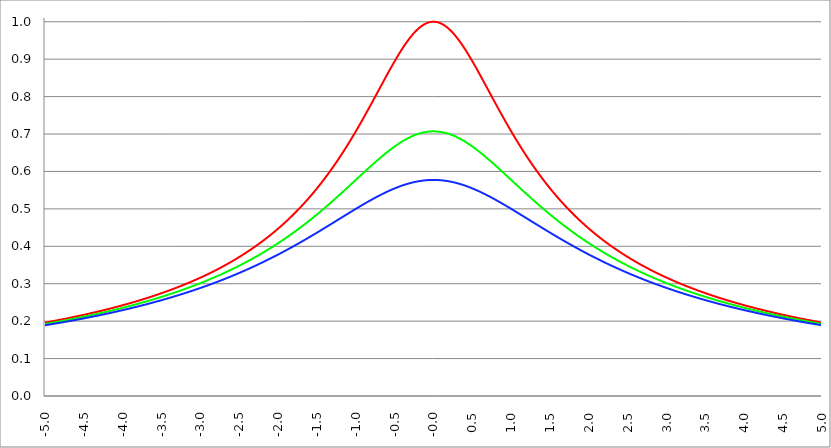
| Category | Series 1 | Series 0 | Series 2 |
|---|---|---|---|
| -5.0 | 0.196 | 0.192 | 0.189 |
| -4.995 | 0.196 | 0.193 | 0.189 |
| -4.99 | 0.196 | 0.193 | 0.189 |
| -4.985 | 0.197 | 0.193 | 0.189 |
| -4.98 | 0.197 | 0.193 | 0.19 |
| -4.975 | 0.197 | 0.193 | 0.19 |
| -4.97 | 0.197 | 0.194 | 0.19 |
| -4.965000000000001 | 0.197 | 0.194 | 0.19 |
| -4.960000000000001 | 0.198 | 0.194 | 0.19 |
| -4.955000000000001 | 0.198 | 0.194 | 0.191 |
| -4.950000000000001 | 0.198 | 0.194 | 0.191 |
| -4.945000000000001 | 0.198 | 0.194 | 0.191 |
| -4.940000000000001 | 0.198 | 0.195 | 0.191 |
| -4.935000000000001 | 0.199 | 0.195 | 0.191 |
| -4.930000000000001 | 0.199 | 0.195 | 0.191 |
| -4.925000000000002 | 0.199 | 0.195 | 0.192 |
| -4.920000000000002 | 0.199 | 0.195 | 0.192 |
| -4.915000000000002 | 0.199 | 0.196 | 0.192 |
| -4.910000000000002 | 0.2 | 0.196 | 0.192 |
| -4.905000000000002 | 0.2 | 0.196 | 0.192 |
| -4.900000000000002 | 0.2 | 0.196 | 0.192 |
| -4.895000000000002 | 0.2 | 0.196 | 0.193 |
| -4.890000000000002 | 0.2 | 0.196 | 0.193 |
| -4.885000000000002 | 0.201 | 0.197 | 0.193 |
| -4.880000000000002 | 0.201 | 0.197 | 0.193 |
| -4.875000000000003 | 0.201 | 0.197 | 0.193 |
| -4.870000000000003 | 0.201 | 0.197 | 0.193 |
| -4.865000000000003 | 0.201 | 0.197 | 0.194 |
| -4.860000000000003 | 0.202 | 0.198 | 0.194 |
| -4.855000000000003 | 0.202 | 0.198 | 0.194 |
| -4.850000000000003 | 0.202 | 0.198 | 0.194 |
| -4.845000000000003 | 0.202 | 0.198 | 0.194 |
| -4.840000000000003 | 0.202 | 0.198 | 0.195 |
| -4.835000000000003 | 0.203 | 0.199 | 0.195 |
| -4.830000000000004 | 0.203 | 0.199 | 0.195 |
| -4.825000000000004 | 0.203 | 0.199 | 0.195 |
| -4.820000000000004 | 0.203 | 0.199 | 0.195 |
| -4.815000000000004 | 0.203 | 0.199 | 0.195 |
| -4.810000000000004 | 0.204 | 0.199 | 0.196 |
| -4.805000000000004 | 0.204 | 0.2 | 0.196 |
| -4.800000000000004 | 0.204 | 0.2 | 0.196 |
| -4.795000000000004 | 0.204 | 0.2 | 0.196 |
| -4.790000000000004 | 0.204 | 0.2 | 0.196 |
| -4.785000000000004 | 0.205 | 0.2 | 0.197 |
| -4.780000000000004 | 0.205 | 0.201 | 0.197 |
| -4.775000000000004 | 0.205 | 0.201 | 0.197 |
| -4.770000000000004 | 0.205 | 0.201 | 0.197 |
| -4.765000000000005 | 0.205 | 0.201 | 0.197 |
| -4.760000000000005 | 0.206 | 0.201 | 0.197 |
| -4.755000000000005 | 0.206 | 0.202 | 0.198 |
| -4.750000000000005 | 0.206 | 0.202 | 0.198 |
| -4.745000000000005 | 0.206 | 0.202 | 0.198 |
| -4.740000000000005 | 0.206 | 0.202 | 0.198 |
| -4.735000000000005 | 0.207 | 0.202 | 0.198 |
| -4.730000000000005 | 0.207 | 0.203 | 0.199 |
| -4.725000000000006 | 0.207 | 0.203 | 0.199 |
| -4.720000000000006 | 0.207 | 0.203 | 0.199 |
| -4.715000000000006 | 0.207 | 0.203 | 0.199 |
| -4.710000000000006 | 0.208 | 0.203 | 0.199 |
| -4.705000000000006 | 0.208 | 0.204 | 0.199 |
| -4.700000000000006 | 0.208 | 0.204 | 0.2 |
| -4.695000000000006 | 0.208 | 0.204 | 0.2 |
| -4.690000000000006 | 0.209 | 0.204 | 0.2 |
| -4.685000000000007 | 0.209 | 0.204 | 0.2 |
| -4.680000000000007 | 0.209 | 0.205 | 0.2 |
| -4.675000000000007 | 0.209 | 0.205 | 0.201 |
| -4.670000000000007 | 0.209 | 0.205 | 0.201 |
| -4.665000000000007 | 0.21 | 0.205 | 0.201 |
| -4.660000000000007 | 0.21 | 0.205 | 0.201 |
| -4.655000000000007 | 0.21 | 0.206 | 0.201 |
| -4.650000000000007 | 0.21 | 0.206 | 0.202 |
| -4.645000000000007 | 0.21 | 0.206 | 0.202 |
| -4.640000000000008 | 0.211 | 0.206 | 0.202 |
| -4.635000000000008 | 0.211 | 0.206 | 0.202 |
| -4.630000000000008 | 0.211 | 0.207 | 0.202 |
| -4.625000000000008 | 0.211 | 0.207 | 0.202 |
| -4.620000000000008 | 0.212 | 0.207 | 0.203 |
| -4.615000000000008 | 0.212 | 0.207 | 0.203 |
| -4.610000000000008 | 0.212 | 0.207 | 0.203 |
| -4.605000000000008 | 0.212 | 0.208 | 0.203 |
| -4.600000000000008 | 0.212 | 0.208 | 0.203 |
| -4.595000000000009 | 0.213 | 0.208 | 0.204 |
| -4.590000000000009 | 0.213 | 0.208 | 0.204 |
| -4.585000000000009 | 0.213 | 0.208 | 0.204 |
| -4.580000000000009 | 0.213 | 0.209 | 0.204 |
| -4.57500000000001 | 0.214 | 0.209 | 0.204 |
| -4.57000000000001 | 0.214 | 0.209 | 0.205 |
| -4.565000000000009 | 0.214 | 0.209 | 0.205 |
| -4.560000000000009 | 0.214 | 0.209 | 0.205 |
| -4.555000000000009 | 0.214 | 0.21 | 0.205 |
| -4.55000000000001 | 0.215 | 0.21 | 0.205 |
| -4.54500000000001 | 0.215 | 0.21 | 0.206 |
| -4.54000000000001 | 0.215 | 0.21 | 0.206 |
| -4.53500000000001 | 0.215 | 0.211 | 0.206 |
| -4.53000000000001 | 0.216 | 0.211 | 0.206 |
| -4.52500000000001 | 0.216 | 0.211 | 0.206 |
| -4.52000000000001 | 0.216 | 0.211 | 0.207 |
| -4.51500000000001 | 0.216 | 0.211 | 0.207 |
| -4.51000000000001 | 0.216 | 0.212 | 0.207 |
| -4.505000000000011 | 0.217 | 0.212 | 0.207 |
| -4.500000000000011 | 0.217 | 0.212 | 0.207 |
| -4.495000000000011 | 0.217 | 0.212 | 0.208 |
| -4.490000000000011 | 0.217 | 0.212 | 0.208 |
| -4.485000000000011 | 0.218 | 0.213 | 0.208 |
| -4.480000000000011 | 0.218 | 0.213 | 0.208 |
| -4.475000000000011 | 0.218 | 0.213 | 0.208 |
| -4.470000000000011 | 0.218 | 0.213 | 0.209 |
| -4.465000000000011 | 0.219 | 0.214 | 0.209 |
| -4.460000000000011 | 0.219 | 0.214 | 0.209 |
| -4.455000000000012 | 0.219 | 0.214 | 0.209 |
| -4.450000000000012 | 0.219 | 0.214 | 0.209 |
| -4.445000000000012 | 0.219 | 0.214 | 0.21 |
| -4.440000000000012 | 0.22 | 0.215 | 0.21 |
| -4.435000000000012 | 0.22 | 0.215 | 0.21 |
| -4.430000000000012 | 0.22 | 0.215 | 0.21 |
| -4.425000000000012 | 0.22 | 0.215 | 0.21 |
| -4.420000000000012 | 0.221 | 0.215 | 0.211 |
| -4.415000000000012 | 0.221 | 0.216 | 0.211 |
| -4.410000000000013 | 0.221 | 0.216 | 0.211 |
| -4.405000000000013 | 0.221 | 0.216 | 0.211 |
| -4.400000000000013 | 0.222 | 0.216 | 0.211 |
| -4.395000000000013 | 0.222 | 0.217 | 0.212 |
| -4.390000000000013 | 0.222 | 0.217 | 0.212 |
| -4.385000000000013 | 0.222 | 0.217 | 0.212 |
| -4.380000000000013 | 0.223 | 0.217 | 0.212 |
| -4.375000000000013 | 0.223 | 0.217 | 0.213 |
| -4.370000000000013 | 0.223 | 0.218 | 0.213 |
| -4.365000000000013 | 0.223 | 0.218 | 0.213 |
| -4.360000000000014 | 0.224 | 0.218 | 0.213 |
| -4.355000000000014 | 0.224 | 0.218 | 0.213 |
| -4.350000000000014 | 0.224 | 0.219 | 0.214 |
| -4.345000000000014 | 0.224 | 0.219 | 0.214 |
| -4.340000000000014 | 0.225 | 0.219 | 0.214 |
| -4.335000000000014 | 0.225 | 0.219 | 0.214 |
| -4.330000000000014 | 0.225 | 0.22 | 0.214 |
| -4.325000000000014 | 0.225 | 0.22 | 0.215 |
| -4.320000000000014 | 0.226 | 0.22 | 0.215 |
| -4.315000000000015 | 0.226 | 0.22 | 0.215 |
| -4.310000000000015 | 0.226 | 0.22 | 0.215 |
| -4.305000000000015 | 0.226 | 0.221 | 0.216 |
| -4.300000000000015 | 0.227 | 0.221 | 0.216 |
| -4.295000000000015 | 0.227 | 0.221 | 0.216 |
| -4.290000000000015 | 0.227 | 0.221 | 0.216 |
| -4.285000000000015 | 0.227 | 0.222 | 0.216 |
| -4.280000000000015 | 0.228 | 0.222 | 0.217 |
| -4.275000000000015 | 0.228 | 0.222 | 0.217 |
| -4.270000000000015 | 0.228 | 0.222 | 0.217 |
| -4.265000000000016 | 0.228 | 0.223 | 0.217 |
| -4.260000000000016 | 0.229 | 0.223 | 0.217 |
| -4.255000000000016 | 0.229 | 0.223 | 0.218 |
| -4.250000000000016 | 0.229 | 0.223 | 0.218 |
| -4.245000000000016 | 0.229 | 0.223 | 0.218 |
| -4.240000000000016 | 0.23 | 0.224 | 0.218 |
| -4.235000000000016 | 0.23 | 0.224 | 0.219 |
| -4.230000000000016 | 0.23 | 0.224 | 0.219 |
| -4.225000000000017 | 0.23 | 0.224 | 0.219 |
| -4.220000000000017 | 0.231 | 0.225 | 0.219 |
| -4.215000000000017 | 0.231 | 0.225 | 0.219 |
| -4.210000000000017 | 0.231 | 0.225 | 0.22 |
| -4.205000000000017 | 0.231 | 0.225 | 0.22 |
| -4.200000000000017 | 0.232 | 0.226 | 0.22 |
| -4.195000000000017 | 0.232 | 0.226 | 0.22 |
| -4.190000000000017 | 0.232 | 0.226 | 0.221 |
| -4.185000000000017 | 0.232 | 0.226 | 0.221 |
| -4.180000000000017 | 0.233 | 0.227 | 0.221 |
| -4.175000000000018 | 0.233 | 0.227 | 0.221 |
| -4.170000000000018 | 0.233 | 0.227 | 0.221 |
| -4.165000000000018 | 0.233 | 0.227 | 0.222 |
| -4.160000000000018 | 0.234 | 0.228 | 0.222 |
| -4.155000000000018 | 0.234 | 0.228 | 0.222 |
| -4.150000000000018 | 0.234 | 0.228 | 0.222 |
| -4.145000000000018 | 0.235 | 0.228 | 0.223 |
| -4.140000000000018 | 0.235 | 0.229 | 0.223 |
| -4.135000000000018 | 0.235 | 0.229 | 0.223 |
| -4.130000000000019 | 0.235 | 0.229 | 0.223 |
| -4.125000000000019 | 0.236 | 0.229 | 0.224 |
| -4.120000000000019 | 0.236 | 0.23 | 0.224 |
| -4.115000000000019 | 0.236 | 0.23 | 0.224 |
| -4.110000000000019 | 0.236 | 0.23 | 0.224 |
| -4.105000000000019 | 0.237 | 0.23 | 0.224 |
| -4.100000000000019 | 0.237 | 0.231 | 0.225 |
| -4.095000000000019 | 0.237 | 0.231 | 0.225 |
| -4.090000000000019 | 0.238 | 0.231 | 0.225 |
| -4.085000000000019 | 0.238 | 0.231 | 0.225 |
| -4.08000000000002 | 0.238 | 0.232 | 0.226 |
| -4.07500000000002 | 0.238 | 0.232 | 0.226 |
| -4.07000000000002 | 0.239 | 0.232 | 0.226 |
| -4.06500000000002 | 0.239 | 0.232 | 0.226 |
| -4.06000000000002 | 0.239 | 0.233 | 0.227 |
| -4.05500000000002 | 0.239 | 0.233 | 0.227 |
| -4.05000000000002 | 0.24 | 0.233 | 0.227 |
| -4.04500000000002 | 0.24 | 0.233 | 0.227 |
| -4.04000000000002 | 0.24 | 0.234 | 0.227 |
| -4.03500000000002 | 0.241 | 0.234 | 0.228 |
| -4.03000000000002 | 0.241 | 0.234 | 0.228 |
| -4.025000000000021 | 0.241 | 0.234 | 0.228 |
| -4.020000000000021 | 0.241 | 0.235 | 0.228 |
| -4.015000000000021 | 0.242 | 0.235 | 0.229 |
| -4.010000000000021 | 0.242 | 0.235 | 0.229 |
| -4.005000000000021 | 0.242 | 0.235 | 0.229 |
| -4.000000000000021 | 0.243 | 0.236 | 0.229 |
| -3.995000000000021 | 0.243 | 0.236 | 0.23 |
| -3.990000000000021 | 0.243 | 0.236 | 0.23 |
| -3.985000000000022 | 0.243 | 0.236 | 0.23 |
| -3.980000000000022 | 0.244 | 0.237 | 0.23 |
| -3.975000000000022 | 0.244 | 0.237 | 0.231 |
| -3.970000000000022 | 0.244 | 0.237 | 0.231 |
| -3.965000000000022 | 0.245 | 0.238 | 0.231 |
| -3.960000000000022 | 0.245 | 0.238 | 0.231 |
| -3.955000000000022 | 0.245 | 0.238 | 0.232 |
| -3.950000000000022 | 0.245 | 0.238 | 0.232 |
| -3.945000000000022 | 0.246 | 0.239 | 0.232 |
| -3.940000000000023 | 0.246 | 0.239 | 0.232 |
| -3.935000000000023 | 0.246 | 0.239 | 0.233 |
| -3.930000000000023 | 0.247 | 0.239 | 0.233 |
| -3.925000000000023 | 0.247 | 0.24 | 0.233 |
| -3.920000000000023 | 0.247 | 0.24 | 0.233 |
| -3.915000000000023 | 0.247 | 0.24 | 0.234 |
| -3.910000000000023 | 0.248 | 0.241 | 0.234 |
| -3.905000000000023 | 0.248 | 0.241 | 0.234 |
| -3.900000000000023 | 0.248 | 0.241 | 0.234 |
| -3.895000000000023 | 0.249 | 0.241 | 0.235 |
| -3.890000000000024 | 0.249 | 0.242 | 0.235 |
| -3.885000000000024 | 0.249 | 0.242 | 0.235 |
| -3.880000000000024 | 0.25 | 0.242 | 0.235 |
| -3.875000000000024 | 0.25 | 0.242 | 0.236 |
| -3.870000000000024 | 0.25 | 0.243 | 0.236 |
| -3.865000000000024 | 0.25 | 0.243 | 0.236 |
| -3.860000000000024 | 0.251 | 0.243 | 0.236 |
| -3.855000000000024 | 0.251 | 0.244 | 0.237 |
| -3.850000000000024 | 0.251 | 0.244 | 0.237 |
| -3.845000000000025 | 0.252 | 0.244 | 0.237 |
| -3.840000000000025 | 0.252 | 0.244 | 0.237 |
| -3.835000000000025 | 0.252 | 0.245 | 0.238 |
| -3.830000000000025 | 0.253 | 0.245 | 0.238 |
| -3.825000000000025 | 0.253 | 0.245 | 0.238 |
| -3.820000000000025 | 0.253 | 0.245 | 0.238 |
| -3.815000000000025 | 0.254 | 0.246 | 0.239 |
| -3.810000000000025 | 0.254 | 0.246 | 0.239 |
| -3.805000000000025 | 0.254 | 0.246 | 0.239 |
| -3.800000000000026 | 0.254 | 0.247 | 0.239 |
| -3.795000000000026 | 0.255 | 0.247 | 0.24 |
| -3.790000000000026 | 0.255 | 0.247 | 0.24 |
| -3.785000000000026 | 0.255 | 0.247 | 0.24 |
| -3.780000000000026 | 0.256 | 0.248 | 0.241 |
| -3.775000000000026 | 0.256 | 0.248 | 0.241 |
| -3.770000000000026 | 0.256 | 0.248 | 0.241 |
| -3.765000000000026 | 0.257 | 0.249 | 0.241 |
| -3.760000000000026 | 0.257 | 0.249 | 0.242 |
| -3.755000000000026 | 0.257 | 0.249 | 0.242 |
| -3.750000000000027 | 0.258 | 0.25 | 0.242 |
| -3.745000000000027 | 0.258 | 0.25 | 0.242 |
| -3.740000000000027 | 0.258 | 0.25 | 0.243 |
| -3.735000000000027 | 0.259 | 0.25 | 0.243 |
| -3.730000000000027 | 0.259 | 0.251 | 0.243 |
| -3.725000000000027 | 0.259 | 0.251 | 0.243 |
| -3.720000000000027 | 0.26 | 0.251 | 0.244 |
| -3.715000000000027 | 0.26 | 0.252 | 0.244 |
| -3.710000000000027 | 0.26 | 0.252 | 0.244 |
| -3.705000000000028 | 0.261 | 0.252 | 0.245 |
| -3.700000000000028 | 0.261 | 0.252 | 0.245 |
| -3.695000000000028 | 0.261 | 0.253 | 0.245 |
| -3.690000000000028 | 0.262 | 0.253 | 0.245 |
| -3.685000000000028 | 0.262 | 0.253 | 0.246 |
| -3.680000000000028 | 0.262 | 0.254 | 0.246 |
| -3.675000000000028 | 0.263 | 0.254 | 0.246 |
| -3.670000000000028 | 0.263 | 0.254 | 0.246 |
| -3.665000000000028 | 0.263 | 0.255 | 0.247 |
| -3.660000000000028 | 0.264 | 0.255 | 0.247 |
| -3.655000000000029 | 0.264 | 0.255 | 0.247 |
| -3.650000000000029 | 0.264 | 0.255 | 0.248 |
| -3.645000000000029 | 0.265 | 0.256 | 0.248 |
| -3.640000000000029 | 0.265 | 0.256 | 0.248 |
| -3.635000000000029 | 0.265 | 0.256 | 0.248 |
| -3.630000000000029 | 0.266 | 0.257 | 0.249 |
| -3.625000000000029 | 0.266 | 0.257 | 0.249 |
| -3.620000000000029 | 0.266 | 0.257 | 0.249 |
| -3.615000000000029 | 0.267 | 0.258 | 0.249 |
| -3.61000000000003 | 0.267 | 0.258 | 0.25 |
| -3.60500000000003 | 0.267 | 0.258 | 0.25 |
| -3.60000000000003 | 0.268 | 0.259 | 0.25 |
| -3.59500000000003 | 0.268 | 0.259 | 0.251 |
| -3.59000000000003 | 0.268 | 0.259 | 0.251 |
| -3.58500000000003 | 0.269 | 0.259 | 0.251 |
| -3.58000000000003 | 0.269 | 0.26 | 0.251 |
| -3.57500000000003 | 0.269 | 0.26 | 0.252 |
| -3.57000000000003 | 0.27 | 0.26 | 0.252 |
| -3.565000000000031 | 0.27 | 0.261 | 0.252 |
| -3.560000000000031 | 0.27 | 0.261 | 0.253 |
| -3.555000000000031 | 0.271 | 0.261 | 0.253 |
| -3.550000000000031 | 0.271 | 0.262 | 0.253 |
| -3.545000000000031 | 0.271 | 0.262 | 0.253 |
| -3.540000000000031 | 0.272 | 0.262 | 0.254 |
| -3.535000000000031 | 0.272 | 0.263 | 0.254 |
| -3.530000000000031 | 0.273 | 0.263 | 0.254 |
| -3.525000000000031 | 0.273 | 0.263 | 0.255 |
| -3.520000000000032 | 0.273 | 0.264 | 0.255 |
| -3.515000000000032 | 0.274 | 0.264 | 0.255 |
| -3.510000000000032 | 0.274 | 0.264 | 0.255 |
| -3.505000000000032 | 0.274 | 0.265 | 0.256 |
| -3.500000000000032 | 0.275 | 0.265 | 0.256 |
| -3.495000000000032 | 0.275 | 0.265 | 0.256 |
| -3.490000000000032 | 0.275 | 0.266 | 0.257 |
| -3.485000000000032 | 0.276 | 0.266 | 0.257 |
| -3.480000000000032 | 0.276 | 0.266 | 0.257 |
| -3.475000000000032 | 0.277 | 0.267 | 0.258 |
| -3.470000000000033 | 0.277 | 0.267 | 0.258 |
| -3.465000000000033 | 0.277 | 0.267 | 0.258 |
| -3.460000000000033 | 0.278 | 0.268 | 0.258 |
| -3.455000000000033 | 0.278 | 0.268 | 0.259 |
| -3.450000000000033 | 0.278 | 0.268 | 0.259 |
| -3.445000000000033 | 0.279 | 0.269 | 0.259 |
| -3.440000000000033 | 0.279 | 0.269 | 0.26 |
| -3.435000000000033 | 0.28 | 0.269 | 0.26 |
| -3.430000000000033 | 0.28 | 0.27 | 0.26 |
| -3.425000000000034 | 0.28 | 0.27 | 0.261 |
| -3.420000000000034 | 0.281 | 0.27 | 0.261 |
| -3.415000000000034 | 0.281 | 0.271 | 0.261 |
| -3.410000000000034 | 0.281 | 0.271 | 0.261 |
| -3.405000000000034 | 0.282 | 0.271 | 0.262 |
| -3.400000000000034 | 0.282 | 0.272 | 0.262 |
| -3.395000000000034 | 0.283 | 0.272 | 0.262 |
| -3.390000000000034 | 0.283 | 0.272 | 0.263 |
| -3.385000000000034 | 0.283 | 0.273 | 0.263 |
| -3.380000000000034 | 0.284 | 0.273 | 0.263 |
| -3.375000000000035 | 0.284 | 0.273 | 0.264 |
| -3.370000000000035 | 0.284 | 0.274 | 0.264 |
| -3.365000000000035 | 0.285 | 0.274 | 0.264 |
| -3.360000000000035 | 0.285 | 0.274 | 0.265 |
| -3.355000000000035 | 0.286 | 0.275 | 0.265 |
| -3.350000000000035 | 0.286 | 0.275 | 0.265 |
| -3.345000000000035 | 0.286 | 0.275 | 0.265 |
| -3.340000000000035 | 0.287 | 0.276 | 0.266 |
| -3.335000000000035 | 0.287 | 0.276 | 0.266 |
| -3.330000000000036 | 0.288 | 0.276 | 0.266 |
| -3.325000000000036 | 0.288 | 0.277 | 0.267 |
| -3.320000000000036 | 0.288 | 0.277 | 0.267 |
| -3.315000000000036 | 0.289 | 0.277 | 0.267 |
| -3.310000000000036 | 0.289 | 0.278 | 0.268 |
| -3.305000000000036 | 0.29 | 0.278 | 0.268 |
| -3.300000000000036 | 0.29 | 0.279 | 0.268 |
| -3.295000000000036 | 0.29 | 0.279 | 0.269 |
| -3.290000000000036 | 0.291 | 0.279 | 0.269 |
| -3.285000000000036 | 0.291 | 0.28 | 0.269 |
| -3.280000000000036 | 0.292 | 0.28 | 0.27 |
| -3.275000000000037 | 0.292 | 0.28 | 0.27 |
| -3.270000000000037 | 0.292 | 0.281 | 0.27 |
| -3.265000000000037 | 0.293 | 0.281 | 0.271 |
| -3.260000000000037 | 0.293 | 0.281 | 0.271 |
| -3.255000000000037 | 0.294 | 0.282 | 0.271 |
| -3.250000000000037 | 0.294 | 0.282 | 0.272 |
| -3.245000000000037 | 0.294 | 0.283 | 0.272 |
| -3.240000000000037 | 0.295 | 0.283 | 0.272 |
| -3.235000000000038 | 0.295 | 0.283 | 0.273 |
| -3.230000000000038 | 0.296 | 0.284 | 0.273 |
| -3.225000000000038 | 0.296 | 0.284 | 0.273 |
| -3.220000000000038 | 0.297 | 0.284 | 0.274 |
| -3.215000000000038 | 0.297 | 0.285 | 0.274 |
| -3.210000000000038 | 0.297 | 0.285 | 0.274 |
| -3.205000000000038 | 0.298 | 0.285 | 0.274 |
| -3.200000000000038 | 0.298 | 0.286 | 0.275 |
| -3.195000000000038 | 0.299 | 0.286 | 0.275 |
| -3.190000000000039 | 0.299 | 0.287 | 0.275 |
| -3.185000000000039 | 0.3 | 0.287 | 0.276 |
| -3.180000000000039 | 0.3 | 0.287 | 0.276 |
| -3.175000000000039 | 0.3 | 0.288 | 0.276 |
| -3.170000000000039 | 0.301 | 0.288 | 0.277 |
| -3.16500000000004 | 0.301 | 0.288 | 0.277 |
| -3.16000000000004 | 0.302 | 0.289 | 0.278 |
| -3.155000000000039 | 0.302 | 0.289 | 0.278 |
| -3.150000000000039 | 0.303 | 0.29 | 0.278 |
| -3.14500000000004 | 0.303 | 0.29 | 0.279 |
| -3.14000000000004 | 0.303 | 0.29 | 0.279 |
| -3.13500000000004 | 0.304 | 0.291 | 0.279 |
| -3.13000000000004 | 0.304 | 0.291 | 0.28 |
| -3.12500000000004 | 0.305 | 0.292 | 0.28 |
| -3.12000000000004 | 0.305 | 0.292 | 0.28 |
| -3.11500000000004 | 0.306 | 0.292 | 0.281 |
| -3.11000000000004 | 0.306 | 0.293 | 0.281 |
| -3.10500000000004 | 0.307 | 0.293 | 0.281 |
| -3.10000000000004 | 0.307 | 0.293 | 0.282 |
| -3.095000000000041 | 0.307 | 0.294 | 0.282 |
| -3.090000000000041 | 0.308 | 0.294 | 0.282 |
| -3.085000000000041 | 0.308 | 0.295 | 0.283 |
| -3.080000000000041 | 0.309 | 0.295 | 0.283 |
| -3.075000000000041 | 0.309 | 0.295 | 0.283 |
| -3.070000000000041 | 0.31 | 0.296 | 0.284 |
| -3.065000000000041 | 0.31 | 0.296 | 0.284 |
| -3.060000000000041 | 0.311 | 0.297 | 0.284 |
| -3.055000000000041 | 0.311 | 0.297 | 0.285 |
| -3.050000000000042 | 0.312 | 0.297 | 0.285 |
| -3.045000000000042 | 0.312 | 0.298 | 0.285 |
| -3.040000000000042 | 0.312 | 0.298 | 0.286 |
| -3.035000000000042 | 0.313 | 0.299 | 0.286 |
| -3.030000000000042 | 0.313 | 0.299 | 0.287 |
| -3.025000000000042 | 0.314 | 0.299 | 0.287 |
| -3.020000000000042 | 0.314 | 0.3 | 0.287 |
| -3.015000000000042 | 0.315 | 0.3 | 0.288 |
| -3.010000000000042 | 0.315 | 0.301 | 0.288 |
| -3.005000000000043 | 0.316 | 0.301 | 0.288 |
| -3.000000000000043 | 0.316 | 0.302 | 0.289 |
| -2.995000000000043 | 0.317 | 0.302 | 0.289 |
| -2.990000000000043 | 0.317 | 0.302 | 0.289 |
| -2.985000000000043 | 0.318 | 0.303 | 0.29 |
| -2.980000000000043 | 0.318 | 0.303 | 0.29 |
| -2.975000000000043 | 0.319 | 0.304 | 0.29 |
| -2.970000000000043 | 0.319 | 0.304 | 0.291 |
| -2.965000000000043 | 0.32 | 0.304 | 0.291 |
| -2.960000000000043 | 0.32 | 0.305 | 0.292 |
| -2.955000000000044 | 0.321 | 0.305 | 0.292 |
| -2.950000000000044 | 0.321 | 0.306 | 0.292 |
| -2.945000000000044 | 0.322 | 0.306 | 0.293 |
| -2.940000000000044 | 0.322 | 0.307 | 0.293 |
| -2.935000000000044 | 0.323 | 0.307 | 0.293 |
| -2.930000000000044 | 0.323 | 0.307 | 0.294 |
| -2.925000000000044 | 0.323 | 0.308 | 0.294 |
| -2.920000000000044 | 0.324 | 0.308 | 0.295 |
| -2.915000000000044 | 0.324 | 0.309 | 0.295 |
| -2.910000000000045 | 0.325 | 0.309 | 0.295 |
| -2.905000000000045 | 0.325 | 0.31 | 0.296 |
| -2.900000000000045 | 0.326 | 0.31 | 0.296 |
| -2.895000000000045 | 0.326 | 0.31 | 0.296 |
| -2.890000000000045 | 0.327 | 0.311 | 0.297 |
| -2.885000000000045 | 0.328 | 0.311 | 0.297 |
| -2.880000000000045 | 0.328 | 0.312 | 0.298 |
| -2.875000000000045 | 0.329 | 0.312 | 0.298 |
| -2.870000000000045 | 0.329 | 0.313 | 0.298 |
| -2.865000000000045 | 0.33 | 0.313 | 0.299 |
| -2.860000000000046 | 0.33 | 0.313 | 0.299 |
| -2.855000000000046 | 0.331 | 0.314 | 0.299 |
| -2.850000000000046 | 0.331 | 0.314 | 0.3 |
| -2.845000000000046 | 0.332 | 0.315 | 0.3 |
| -2.840000000000046 | 0.332 | 0.315 | 0.301 |
| -2.835000000000046 | 0.333 | 0.316 | 0.301 |
| -2.830000000000046 | 0.333 | 0.316 | 0.301 |
| -2.825000000000046 | 0.334 | 0.317 | 0.302 |
| -2.820000000000046 | 0.334 | 0.317 | 0.302 |
| -2.815000000000047 | 0.335 | 0.317 | 0.303 |
| -2.810000000000047 | 0.335 | 0.318 | 0.303 |
| -2.805000000000047 | 0.336 | 0.318 | 0.303 |
| -2.800000000000047 | 0.336 | 0.319 | 0.304 |
| -2.795000000000047 | 0.337 | 0.319 | 0.304 |
| -2.790000000000047 | 0.337 | 0.32 | 0.305 |
| -2.785000000000047 | 0.338 | 0.32 | 0.305 |
| -2.780000000000047 | 0.338 | 0.321 | 0.305 |
| -2.775000000000047 | 0.339 | 0.321 | 0.306 |
| -2.770000000000047 | 0.34 | 0.322 | 0.306 |
| -2.765000000000048 | 0.34 | 0.322 | 0.306 |
| -2.760000000000048 | 0.341 | 0.322 | 0.307 |
| -2.755000000000048 | 0.341 | 0.323 | 0.307 |
| -2.750000000000048 | 0.342 | 0.323 | 0.308 |
| -2.745000000000048 | 0.342 | 0.324 | 0.308 |
| -2.740000000000048 | 0.343 | 0.324 | 0.308 |
| -2.735000000000048 | 0.343 | 0.325 | 0.309 |
| -2.730000000000048 | 0.344 | 0.325 | 0.309 |
| -2.725000000000048 | 0.345 | 0.326 | 0.31 |
| -2.720000000000049 | 0.345 | 0.326 | 0.31 |
| -2.715000000000049 | 0.346 | 0.327 | 0.311 |
| -2.710000000000049 | 0.346 | 0.327 | 0.311 |
| -2.705000000000049 | 0.347 | 0.328 | 0.311 |
| -2.700000000000049 | 0.347 | 0.328 | 0.312 |
| -2.695000000000049 | 0.348 | 0.329 | 0.312 |
| -2.690000000000049 | 0.348 | 0.329 | 0.313 |
| -2.685000000000049 | 0.349 | 0.33 | 0.313 |
| -2.680000000000049 | 0.35 | 0.33 | 0.313 |
| -2.675000000000049 | 0.35 | 0.33 | 0.314 |
| -2.67000000000005 | 0.351 | 0.331 | 0.314 |
| -2.66500000000005 | 0.351 | 0.331 | 0.315 |
| -2.66000000000005 | 0.352 | 0.332 | 0.315 |
| -2.65500000000005 | 0.352 | 0.332 | 0.315 |
| -2.65000000000005 | 0.353 | 0.333 | 0.316 |
| -2.64500000000005 | 0.354 | 0.333 | 0.316 |
| -2.64000000000005 | 0.354 | 0.334 | 0.317 |
| -2.63500000000005 | 0.355 | 0.334 | 0.317 |
| -2.63000000000005 | 0.355 | 0.335 | 0.318 |
| -2.625000000000051 | 0.356 | 0.335 | 0.318 |
| -2.620000000000051 | 0.357 | 0.336 | 0.318 |
| -2.615000000000051 | 0.357 | 0.336 | 0.319 |
| -2.610000000000051 | 0.358 | 0.337 | 0.319 |
| -2.605000000000051 | 0.358 | 0.337 | 0.32 |
| -2.600000000000051 | 0.359 | 0.338 | 0.32 |
| -2.595000000000051 | 0.36 | 0.338 | 0.321 |
| -2.590000000000051 | 0.36 | 0.339 | 0.321 |
| -2.585000000000051 | 0.361 | 0.339 | 0.321 |
| -2.580000000000052 | 0.361 | 0.34 | 0.322 |
| -2.575000000000052 | 0.362 | 0.34 | 0.322 |
| -2.570000000000052 | 0.363 | 0.341 | 0.323 |
| -2.565000000000052 | 0.363 | 0.341 | 0.323 |
| -2.560000000000052 | 0.364 | 0.342 | 0.324 |
| -2.555000000000052 | 0.364 | 0.342 | 0.324 |
| -2.550000000000052 | 0.365 | 0.343 | 0.324 |
| -2.545000000000052 | 0.366 | 0.343 | 0.325 |
| -2.540000000000052 | 0.366 | 0.344 | 0.325 |
| -2.535000000000053 | 0.367 | 0.344 | 0.326 |
| -2.530000000000053 | 0.368 | 0.345 | 0.326 |
| -2.525000000000053 | 0.368 | 0.346 | 0.327 |
| -2.520000000000053 | 0.369 | 0.346 | 0.327 |
| -2.515000000000053 | 0.369 | 0.347 | 0.327 |
| -2.510000000000053 | 0.37 | 0.347 | 0.328 |
| -2.505000000000053 | 0.371 | 0.348 | 0.328 |
| -2.500000000000053 | 0.371 | 0.348 | 0.329 |
| -2.495000000000053 | 0.372 | 0.349 | 0.329 |
| -2.490000000000053 | 0.373 | 0.349 | 0.33 |
| -2.485000000000054 | 0.373 | 0.35 | 0.33 |
| -2.480000000000054 | 0.374 | 0.35 | 0.331 |
| -2.475000000000054 | 0.375 | 0.351 | 0.331 |
| -2.470000000000054 | 0.375 | 0.351 | 0.331 |
| -2.465000000000054 | 0.376 | 0.352 | 0.332 |
| -2.460000000000054 | 0.377 | 0.352 | 0.332 |
| -2.455000000000054 | 0.377 | 0.353 | 0.333 |
| -2.450000000000054 | 0.378 | 0.353 | 0.333 |
| -2.445000000000054 | 0.379 | 0.354 | 0.334 |
| -2.440000000000055 | 0.379 | 0.355 | 0.334 |
| -2.435000000000055 | 0.38 | 0.355 | 0.335 |
| -2.430000000000055 | 0.381 | 0.356 | 0.335 |
| -2.425000000000055 | 0.381 | 0.356 | 0.336 |
| -2.420000000000055 | 0.382 | 0.357 | 0.336 |
| -2.415000000000055 | 0.383 | 0.357 | 0.336 |
| -2.410000000000055 | 0.383 | 0.358 | 0.337 |
| -2.405000000000055 | 0.384 | 0.358 | 0.337 |
| -2.400000000000055 | 0.385 | 0.359 | 0.338 |
| -2.395000000000055 | 0.385 | 0.36 | 0.338 |
| -2.390000000000056 | 0.386 | 0.36 | 0.339 |
| -2.385000000000056 | 0.387 | 0.361 | 0.339 |
| -2.380000000000056 | 0.387 | 0.361 | 0.34 |
| -2.375000000000056 | 0.388 | 0.362 | 0.34 |
| -2.370000000000056 | 0.389 | 0.362 | 0.341 |
| -2.365000000000056 | 0.389 | 0.363 | 0.341 |
| -2.360000000000056 | 0.39 | 0.363 | 0.342 |
| -2.355000000000056 | 0.391 | 0.364 | 0.342 |
| -2.350000000000056 | 0.392 | 0.365 | 0.343 |
| -2.345000000000057 | 0.392 | 0.365 | 0.343 |
| -2.340000000000057 | 0.393 | 0.366 | 0.343 |
| -2.335000000000057 | 0.394 | 0.366 | 0.344 |
| -2.330000000000057 | 0.394 | 0.367 | 0.344 |
| -2.325000000000057 | 0.395 | 0.367 | 0.345 |
| -2.320000000000057 | 0.396 | 0.368 | 0.345 |
| -2.315000000000057 | 0.397 | 0.369 | 0.346 |
| -2.310000000000057 | 0.397 | 0.369 | 0.346 |
| -2.305000000000057 | 0.398 | 0.37 | 0.347 |
| -2.300000000000058 | 0.399 | 0.37 | 0.347 |
| -2.295000000000058 | 0.399 | 0.371 | 0.348 |
| -2.290000000000058 | 0.4 | 0.372 | 0.348 |
| -2.285000000000058 | 0.401 | 0.372 | 0.349 |
| -2.280000000000058 | 0.402 | 0.373 | 0.349 |
| -2.275000000000058 | 0.402 | 0.373 | 0.35 |
| -2.270000000000058 | 0.403 | 0.374 | 0.35 |
| -2.265000000000058 | 0.404 | 0.374 | 0.351 |
| -2.260000000000058 | 0.405 | 0.375 | 0.351 |
| -2.255000000000058 | 0.405 | 0.376 | 0.352 |
| -2.250000000000059 | 0.406 | 0.376 | 0.352 |
| -2.245000000000059 | 0.407 | 0.377 | 0.353 |
| -2.240000000000059 | 0.408 | 0.377 | 0.353 |
| -2.235000000000059 | 0.408 | 0.378 | 0.354 |
| -2.23000000000006 | 0.409 | 0.379 | 0.354 |
| -2.22500000000006 | 0.41 | 0.379 | 0.355 |
| -2.22000000000006 | 0.411 | 0.38 | 0.355 |
| -2.215000000000059 | 0.411 | 0.381 | 0.356 |
| -2.210000000000059 | 0.412 | 0.381 | 0.356 |
| -2.20500000000006 | 0.413 | 0.382 | 0.357 |
| -2.20000000000006 | 0.414 | 0.382 | 0.357 |
| -2.19500000000006 | 0.415 | 0.383 | 0.358 |
| -2.19000000000006 | 0.415 | 0.384 | 0.358 |
| -2.18500000000006 | 0.416 | 0.384 | 0.359 |
| -2.18000000000006 | 0.417 | 0.385 | 0.359 |
| -2.17500000000006 | 0.418 | 0.385 | 0.36 |
| -2.17000000000006 | 0.419 | 0.386 | 0.36 |
| -2.16500000000006 | 0.419 | 0.387 | 0.361 |
| -2.160000000000061 | 0.42 | 0.387 | 0.361 |
| -2.155000000000061 | 0.421 | 0.388 | 0.362 |
| -2.150000000000061 | 0.422 | 0.389 | 0.362 |
| -2.145000000000061 | 0.423 | 0.389 | 0.363 |
| -2.140000000000061 | 0.423 | 0.39 | 0.363 |
| -2.135000000000061 | 0.424 | 0.39 | 0.364 |
| -2.130000000000061 | 0.425 | 0.391 | 0.364 |
| -2.125000000000061 | 0.426 | 0.392 | 0.365 |
| -2.120000000000061 | 0.427 | 0.392 | 0.365 |
| -2.115000000000061 | 0.427 | 0.393 | 0.366 |
| -2.110000000000062 | 0.428 | 0.394 | 0.366 |
| -2.105000000000062 | 0.429 | 0.394 | 0.367 |
| -2.100000000000062 | 0.43 | 0.395 | 0.367 |
| -2.095000000000062 | 0.431 | 0.396 | 0.368 |
| -2.090000000000062 | 0.432 | 0.396 | 0.368 |
| -2.085000000000062 | 0.432 | 0.397 | 0.369 |
| -2.080000000000062 | 0.433 | 0.398 | 0.369 |
| -2.075000000000062 | 0.434 | 0.398 | 0.37 |
| -2.070000000000062 | 0.435 | 0.399 | 0.37 |
| -2.065000000000063 | 0.436 | 0.4 | 0.371 |
| -2.060000000000063 | 0.437 | 0.4 | 0.372 |
| -2.055000000000063 | 0.438 | 0.401 | 0.372 |
| -2.050000000000063 | 0.438 | 0.402 | 0.373 |
| -2.045000000000063 | 0.439 | 0.402 | 0.373 |
| -2.040000000000063 | 0.44 | 0.403 | 0.374 |
| -2.035000000000063 | 0.441 | 0.404 | 0.374 |
| -2.030000000000063 | 0.442 | 0.404 | 0.375 |
| -2.025000000000063 | 0.443 | 0.405 | 0.375 |
| -2.020000000000064 | 0.444 | 0.406 | 0.376 |
| -2.015000000000064 | 0.445 | 0.406 | 0.376 |
| -2.010000000000064 | 0.445 | 0.407 | 0.377 |
| -2.005000000000064 | 0.446 | 0.408 | 0.377 |
| -2.000000000000064 | 0.447 | 0.408 | 0.378 |
| -1.995000000000064 | 0.448 | 0.409 | 0.379 |
| -1.990000000000064 | 0.449 | 0.41 | 0.379 |
| -1.985000000000064 | 0.45 | 0.41 | 0.38 |
| -1.980000000000064 | 0.451 | 0.411 | 0.38 |
| -1.975000000000064 | 0.452 | 0.412 | 0.381 |
| -1.970000000000065 | 0.453 | 0.412 | 0.381 |
| -1.965000000000065 | 0.454 | 0.413 | 0.382 |
| -1.960000000000065 | 0.454 | 0.414 | 0.382 |
| -1.955000000000065 | 0.455 | 0.414 | 0.383 |
| -1.950000000000065 | 0.456 | 0.415 | 0.383 |
| -1.945000000000065 | 0.457 | 0.416 | 0.384 |
| -1.940000000000065 | 0.458 | 0.417 | 0.385 |
| -1.935000000000065 | 0.459 | 0.417 | 0.385 |
| -1.930000000000065 | 0.46 | 0.418 | 0.386 |
| -1.925000000000066 | 0.461 | 0.419 | 0.386 |
| -1.920000000000066 | 0.462 | 0.419 | 0.387 |
| -1.915000000000066 | 0.463 | 0.42 | 0.387 |
| -1.910000000000066 | 0.464 | 0.421 | 0.388 |
| -1.905000000000066 | 0.465 | 0.421 | 0.388 |
| -1.900000000000066 | 0.466 | 0.422 | 0.389 |
| -1.895000000000066 | 0.467 | 0.423 | 0.39 |
| -1.890000000000066 | 0.468 | 0.424 | 0.39 |
| -1.885000000000066 | 0.469 | 0.424 | 0.391 |
| -1.880000000000066 | 0.47 | 0.425 | 0.391 |
| -1.875000000000067 | 0.471 | 0.426 | 0.392 |
| -1.870000000000067 | 0.472 | 0.427 | 0.392 |
| -1.865000000000067 | 0.473 | 0.427 | 0.393 |
| -1.860000000000067 | 0.474 | 0.428 | 0.393 |
| -1.855000000000067 | 0.475 | 0.429 | 0.394 |
| -1.850000000000067 | 0.476 | 0.429 | 0.395 |
| -1.845000000000067 | 0.477 | 0.43 | 0.395 |
| -1.840000000000067 | 0.478 | 0.431 | 0.396 |
| -1.835000000000067 | 0.479 | 0.432 | 0.396 |
| -1.830000000000068 | 0.48 | 0.432 | 0.397 |
| -1.825000000000068 | 0.481 | 0.433 | 0.397 |
| -1.820000000000068 | 0.482 | 0.434 | 0.398 |
| -1.815000000000068 | 0.483 | 0.435 | 0.399 |
| -1.810000000000068 | 0.484 | 0.435 | 0.399 |
| -1.805000000000068 | 0.485 | 0.436 | 0.4 |
| -1.800000000000068 | 0.486 | 0.437 | 0.4 |
| -1.795000000000068 | 0.487 | 0.438 | 0.401 |
| -1.790000000000068 | 0.488 | 0.438 | 0.401 |
| -1.785000000000068 | 0.489 | 0.439 | 0.402 |
| -1.780000000000069 | 0.49 | 0.44 | 0.403 |
| -1.775000000000069 | 0.491 | 0.441 | 0.403 |
| -1.770000000000069 | 0.492 | 0.441 | 0.404 |
| -1.765000000000069 | 0.493 | 0.442 | 0.404 |
| -1.760000000000069 | 0.494 | 0.443 | 0.405 |
| -1.75500000000007 | 0.495 | 0.444 | 0.406 |
| -1.75000000000007 | 0.496 | 0.444 | 0.406 |
| -1.745000000000069 | 0.497 | 0.445 | 0.407 |
| -1.740000000000069 | 0.498 | 0.446 | 0.407 |
| -1.73500000000007 | 0.499 | 0.447 | 0.408 |
| -1.73000000000007 | 0.5 | 0.448 | 0.408 |
| -1.72500000000007 | 0.502 | 0.448 | 0.409 |
| -1.72000000000007 | 0.503 | 0.449 | 0.41 |
| -1.71500000000007 | 0.504 | 0.45 | 0.41 |
| -1.71000000000007 | 0.505 | 0.451 | 0.411 |
| -1.70500000000007 | 0.506 | 0.451 | 0.411 |
| -1.70000000000007 | 0.507 | 0.452 | 0.412 |
| -1.69500000000007 | 0.508 | 0.453 | 0.413 |
| -1.69000000000007 | 0.509 | 0.454 | 0.413 |
| -1.685000000000071 | 0.51 | 0.455 | 0.414 |
| -1.680000000000071 | 0.511 | 0.455 | 0.414 |
| -1.675000000000071 | 0.513 | 0.456 | 0.415 |
| -1.670000000000071 | 0.514 | 0.457 | 0.416 |
| -1.665000000000071 | 0.515 | 0.458 | 0.416 |
| -1.660000000000071 | 0.516 | 0.459 | 0.417 |
| -1.655000000000071 | 0.517 | 0.459 | 0.417 |
| -1.650000000000071 | 0.518 | 0.46 | 0.418 |
| -1.645000000000071 | 0.519 | 0.461 | 0.419 |
| -1.640000000000072 | 0.521 | 0.462 | 0.419 |
| -1.635000000000072 | 0.522 | 0.463 | 0.42 |
| -1.630000000000072 | 0.523 | 0.463 | 0.42 |
| -1.625000000000072 | 0.524 | 0.464 | 0.421 |
| -1.620000000000072 | 0.525 | 0.465 | 0.422 |
| -1.615000000000072 | 0.526 | 0.466 | 0.422 |
| -1.610000000000072 | 0.528 | 0.467 | 0.423 |
| -1.605000000000072 | 0.529 | 0.467 | 0.423 |
| -1.600000000000072 | 0.53 | 0.468 | 0.424 |
| -1.595000000000073 | 0.531 | 0.469 | 0.425 |
| -1.590000000000073 | 0.532 | 0.47 | 0.425 |
| -1.585000000000073 | 0.534 | 0.471 | 0.426 |
| -1.580000000000073 | 0.535 | 0.472 | 0.427 |
| -1.575000000000073 | 0.536 | 0.472 | 0.427 |
| -1.570000000000073 | 0.537 | 0.473 | 0.428 |
| -1.565000000000073 | 0.538 | 0.474 | 0.428 |
| -1.560000000000073 | 0.54 | 0.475 | 0.429 |
| -1.555000000000073 | 0.541 | 0.476 | 0.43 |
| -1.550000000000074 | 0.542 | 0.477 | 0.43 |
| -1.545000000000074 | 0.543 | 0.477 | 0.431 |
| -1.540000000000074 | 0.545 | 0.478 | 0.431 |
| -1.535000000000074 | 0.546 | 0.479 | 0.432 |
| -1.530000000000074 | 0.547 | 0.48 | 0.433 |
| -1.525000000000074 | 0.548 | 0.481 | 0.433 |
| -1.520000000000074 | 0.55 | 0.482 | 0.434 |
| -1.515000000000074 | 0.551 | 0.483 | 0.435 |
| -1.510000000000074 | 0.552 | 0.483 | 0.435 |
| -1.505000000000074 | 0.553 | 0.484 | 0.436 |
| -1.500000000000075 | 0.555 | 0.485 | 0.436 |
| -1.495000000000075 | 0.556 | 0.486 | 0.437 |
| -1.490000000000075 | 0.557 | 0.487 | 0.438 |
| -1.485000000000075 | 0.559 | 0.488 | 0.438 |
| -1.480000000000075 | 0.56 | 0.489 | 0.439 |
| -1.475000000000075 | 0.561 | 0.489 | 0.44 |
| -1.470000000000075 | 0.562 | 0.49 | 0.44 |
| -1.465000000000075 | 0.564 | 0.491 | 0.441 |
| -1.460000000000075 | 0.565 | 0.492 | 0.441 |
| -1.455000000000076 | 0.566 | 0.493 | 0.442 |
| -1.450000000000076 | 0.568 | 0.494 | 0.443 |
| -1.445000000000076 | 0.569 | 0.495 | 0.443 |
| -1.440000000000076 | 0.57 | 0.495 | 0.444 |
| -1.435000000000076 | 0.572 | 0.496 | 0.445 |
| -1.430000000000076 | 0.573 | 0.497 | 0.445 |
| -1.425000000000076 | 0.574 | 0.498 | 0.446 |
| -1.420000000000076 | 0.576 | 0.499 | 0.446 |
| -1.415000000000076 | 0.577 | 0.5 | 0.447 |
| -1.410000000000077 | 0.578 | 0.501 | 0.448 |
| -1.405000000000077 | 0.58 | 0.502 | 0.448 |
| -1.400000000000077 | 0.581 | 0.503 | 0.449 |
| -1.395000000000077 | 0.583 | 0.503 | 0.45 |
| -1.390000000000077 | 0.584 | 0.504 | 0.45 |
| -1.385000000000077 | 0.585 | 0.505 | 0.451 |
| -1.380000000000077 | 0.587 | 0.506 | 0.452 |
| -1.375000000000077 | 0.588 | 0.507 | 0.452 |
| -1.370000000000077 | 0.59 | 0.508 | 0.453 |
| -1.365000000000077 | 0.591 | 0.509 | 0.453 |
| -1.360000000000078 | 0.592 | 0.51 | 0.454 |
| -1.355000000000078 | 0.594 | 0.511 | 0.455 |
| -1.350000000000078 | 0.595 | 0.511 | 0.455 |
| -1.345000000000078 | 0.597 | 0.512 | 0.456 |
| -1.340000000000078 | 0.598 | 0.513 | 0.457 |
| -1.335000000000078 | 0.6 | 0.514 | 0.457 |
| -1.330000000000078 | 0.601 | 0.515 | 0.458 |
| -1.325000000000078 | 0.602 | 0.516 | 0.459 |
| -1.320000000000078 | 0.604 | 0.517 | 0.459 |
| -1.315000000000079 | 0.605 | 0.518 | 0.46 |
| -1.310000000000079 | 0.607 | 0.519 | 0.46 |
| -1.305000000000079 | 0.608 | 0.52 | 0.461 |
| -1.300000000000079 | 0.61 | 0.521 | 0.462 |
| -1.295000000000079 | 0.611 | 0.521 | 0.462 |
| -1.29000000000008 | 0.613 | 0.522 | 0.463 |
| -1.285000000000079 | 0.614 | 0.523 | 0.464 |
| -1.280000000000079 | 0.616 | 0.524 | 0.464 |
| -1.275000000000079 | 0.617 | 0.525 | 0.465 |
| -1.270000000000079 | 0.619 | 0.526 | 0.466 |
| -1.26500000000008 | 0.62 | 0.527 | 0.466 |
| -1.26000000000008 | 0.622 | 0.528 | 0.467 |
| -1.25500000000008 | 0.623 | 0.529 | 0.468 |
| -1.25000000000008 | 0.625 | 0.53 | 0.468 |
| -1.24500000000008 | 0.626 | 0.531 | 0.469 |
| -1.24000000000008 | 0.628 | 0.532 | 0.469 |
| -1.23500000000008 | 0.629 | 0.533 | 0.47 |
| -1.23000000000008 | 0.631 | 0.534 | 0.471 |
| -1.22500000000008 | 0.632 | 0.534 | 0.471 |
| -1.220000000000081 | 0.634 | 0.535 | 0.472 |
| -1.215000000000081 | 0.635 | 0.536 | 0.473 |
| -1.210000000000081 | 0.637 | 0.537 | 0.473 |
| -1.205000000000081 | 0.639 | 0.538 | 0.474 |
| -1.200000000000081 | 0.64 | 0.539 | 0.475 |
| -1.195000000000081 | 0.642 | 0.54 | 0.475 |
| -1.190000000000081 | 0.643 | 0.541 | 0.476 |
| -1.185000000000081 | 0.645 | 0.542 | 0.477 |
| -1.180000000000081 | 0.647 | 0.543 | 0.477 |
| -1.175000000000082 | 0.648 | 0.544 | 0.478 |
| -1.170000000000082 | 0.65 | 0.545 | 0.478 |
| -1.165000000000082 | 0.651 | 0.546 | 0.479 |
| -1.160000000000082 | 0.653 | 0.547 | 0.48 |
| -1.155000000000082 | 0.655 | 0.548 | 0.48 |
| -1.150000000000082 | 0.656 | 0.549 | 0.481 |
| -1.145000000000082 | 0.658 | 0.55 | 0.482 |
| -1.140000000000082 | 0.659 | 0.551 | 0.482 |
| -1.135000000000082 | 0.661 | 0.551 | 0.483 |
| -1.130000000000082 | 0.663 | 0.552 | 0.484 |
| -1.125000000000083 | 0.664 | 0.553 | 0.484 |
| -1.120000000000083 | 0.666 | 0.554 | 0.485 |
| -1.115000000000083 | 0.668 | 0.555 | 0.485 |
| -1.110000000000083 | 0.669 | 0.556 | 0.486 |
| -1.105000000000083 | 0.671 | 0.557 | 0.487 |
| -1.100000000000083 | 0.673 | 0.558 | 0.487 |
| -1.095000000000083 | 0.674 | 0.559 | 0.488 |
| -1.090000000000083 | 0.676 | 0.56 | 0.489 |
| -1.085000000000083 | 0.678 | 0.561 | 0.489 |
| -1.080000000000084 | 0.679 | 0.562 | 0.49 |
| -1.075000000000084 | 0.681 | 0.563 | 0.491 |
| -1.070000000000084 | 0.683 | 0.564 | 0.491 |
| -1.065000000000084 | 0.685 | 0.565 | 0.492 |
| -1.060000000000084 | 0.686 | 0.566 | 0.492 |
| -1.055000000000084 | 0.688 | 0.567 | 0.493 |
| -1.050000000000084 | 0.69 | 0.568 | 0.494 |
| -1.045000000000084 | 0.691 | 0.569 | 0.494 |
| -1.040000000000084 | 0.693 | 0.57 | 0.495 |
| -1.035000000000085 | 0.695 | 0.571 | 0.496 |
| -1.030000000000085 | 0.697 | 0.572 | 0.496 |
| -1.025000000000085 | 0.698 | 0.573 | 0.497 |
| -1.020000000000085 | 0.7 | 0.574 | 0.497 |
| -1.015000000000085 | 0.702 | 0.574 | 0.498 |
| -1.010000000000085 | 0.704 | 0.575 | 0.499 |
| -1.005000000000085 | 0.705 | 0.576 | 0.499 |
| -1.000000000000085 | 0.707 | 0.577 | 0.5 |
| -0.995000000000085 | 0.709 | 0.578 | 0.501 |
| -0.990000000000085 | 0.711 | 0.579 | 0.501 |
| -0.985000000000085 | 0.712 | 0.58 | 0.502 |
| -0.980000000000085 | 0.714 | 0.581 | 0.502 |
| -0.975000000000085 | 0.716 | 0.582 | 0.503 |
| -0.970000000000085 | 0.718 | 0.583 | 0.504 |
| -0.965000000000085 | 0.72 | 0.584 | 0.504 |
| -0.960000000000085 | 0.721 | 0.585 | 0.505 |
| -0.955000000000085 | 0.723 | 0.586 | 0.506 |
| -0.950000000000085 | 0.725 | 0.587 | 0.506 |
| -0.945000000000085 | 0.727 | 0.588 | 0.507 |
| -0.940000000000085 | 0.729 | 0.589 | 0.507 |
| -0.935000000000085 | 0.73 | 0.59 | 0.508 |
| -0.930000000000085 | 0.732 | 0.591 | 0.509 |
| -0.925000000000085 | 0.734 | 0.592 | 0.509 |
| -0.920000000000085 | 0.736 | 0.593 | 0.51 |
| -0.915000000000085 | 0.738 | 0.594 | 0.51 |
| -0.910000000000085 | 0.74 | 0.595 | 0.511 |
| -0.905000000000085 | 0.741 | 0.596 | 0.512 |
| -0.900000000000085 | 0.743 | 0.597 | 0.512 |
| -0.895000000000085 | 0.745 | 0.598 | 0.513 |
| -0.890000000000085 | 0.747 | 0.598 | 0.514 |
| -0.885000000000085 | 0.749 | 0.599 | 0.514 |
| -0.880000000000085 | 0.751 | 0.6 | 0.515 |
| -0.875000000000085 | 0.753 | 0.601 | 0.515 |
| -0.870000000000085 | 0.754 | 0.602 | 0.516 |
| -0.865000000000085 | 0.756 | 0.603 | 0.517 |
| -0.860000000000085 | 0.758 | 0.604 | 0.517 |
| -0.855000000000085 | 0.76 | 0.605 | 0.518 |
| -0.850000000000085 | 0.762 | 0.606 | 0.518 |
| -0.845000000000085 | 0.764 | 0.607 | 0.519 |
| -0.840000000000085 | 0.766 | 0.608 | 0.519 |
| -0.835000000000085 | 0.768 | 0.609 | 0.52 |
| -0.830000000000085 | 0.769 | 0.61 | 0.521 |
| -0.825000000000085 | 0.771 | 0.611 | 0.521 |
| -0.820000000000085 | 0.773 | 0.612 | 0.522 |
| -0.815000000000085 | 0.775 | 0.613 | 0.522 |
| -0.810000000000085 | 0.777 | 0.614 | 0.523 |
| -0.805000000000085 | 0.779 | 0.615 | 0.524 |
| -0.800000000000085 | 0.781 | 0.615 | 0.524 |
| -0.795000000000085 | 0.783 | 0.616 | 0.525 |
| -0.790000000000085 | 0.785 | 0.617 | 0.525 |
| -0.785000000000085 | 0.787 | 0.618 | 0.526 |
| -0.780000000000085 | 0.789 | 0.619 | 0.526 |
| -0.775000000000085 | 0.79 | 0.62 | 0.527 |
| -0.770000000000085 | 0.792 | 0.621 | 0.528 |
| -0.765000000000085 | 0.794 | 0.622 | 0.528 |
| -0.760000000000085 | 0.796 | 0.623 | 0.529 |
| -0.755000000000085 | 0.798 | 0.624 | 0.529 |
| -0.750000000000085 | 0.8 | 0.625 | 0.53 |
| -0.745000000000085 | 0.802 | 0.626 | 0.53 |
| -0.740000000000085 | 0.804 | 0.627 | 0.531 |
| -0.735000000000085 | 0.806 | 0.627 | 0.531 |
| -0.730000000000085 | 0.808 | 0.628 | 0.532 |
| -0.725000000000085 | 0.81 | 0.629 | 0.533 |
| -0.720000000000085 | 0.812 | 0.63 | 0.533 |
| -0.715000000000085 | 0.813 | 0.631 | 0.534 |
| -0.710000000000085 | 0.815 | 0.632 | 0.534 |
| -0.705000000000085 | 0.817 | 0.633 | 0.535 |
| -0.700000000000085 | 0.819 | 0.634 | 0.535 |
| -0.695000000000085 | 0.821 | 0.635 | 0.536 |
| -0.690000000000085 | 0.823 | 0.636 | 0.536 |
| -0.685000000000085 | 0.825 | 0.636 | 0.537 |
| -0.680000000000085 | 0.827 | 0.637 | 0.537 |
| -0.675000000000085 | 0.829 | 0.638 | 0.538 |
| -0.670000000000085 | 0.831 | 0.639 | 0.538 |
| -0.665000000000085 | 0.833 | 0.64 | 0.539 |
| -0.660000000000085 | 0.835 | 0.641 | 0.54 |
| -0.655000000000085 | 0.837 | 0.642 | 0.54 |
| -0.650000000000085 | 0.838 | 0.642 | 0.541 |
| -0.645000000000085 | 0.84 | 0.643 | 0.541 |
| -0.640000000000085 | 0.842 | 0.644 | 0.542 |
| -0.635000000000085 | 0.844 | 0.645 | 0.542 |
| -0.630000000000085 | 0.846 | 0.646 | 0.543 |
| -0.625000000000085 | 0.848 | 0.647 | 0.543 |
| -0.620000000000085 | 0.85 | 0.648 | 0.544 |
| -0.615000000000085 | 0.852 | 0.648 | 0.544 |
| -0.610000000000085 | 0.854 | 0.649 | 0.545 |
| -0.605000000000085 | 0.856 | 0.65 | 0.545 |
| -0.600000000000085 | 0.857 | 0.651 | 0.546 |
| -0.595000000000085 | 0.859 | 0.652 | 0.546 |
| -0.590000000000085 | 0.861 | 0.653 | 0.547 |
| -0.585000000000085 | 0.863 | 0.653 | 0.547 |
| -0.580000000000085 | 0.865 | 0.654 | 0.547 |
| -0.575000000000085 | 0.867 | 0.655 | 0.548 |
| -0.570000000000085 | 0.869 | 0.656 | 0.548 |
| -0.565000000000085 | 0.871 | 0.657 | 0.549 |
| -0.560000000000085 | 0.873 | 0.657 | 0.549 |
| -0.555000000000085 | 0.874 | 0.658 | 0.55 |
| -0.550000000000085 | 0.876 | 0.659 | 0.55 |
| -0.545000000000085 | 0.878 | 0.66 | 0.551 |
| -0.540000000000085 | 0.88 | 0.661 | 0.551 |
| -0.535000000000085 | 0.882 | 0.661 | 0.552 |
| -0.530000000000085 | 0.884 | 0.662 | 0.552 |
| -0.525000000000085 | 0.885 | 0.663 | 0.553 |
| -0.520000000000085 | 0.887 | 0.664 | 0.553 |
| -0.515000000000085 | 0.889 | 0.664 | 0.553 |
| -0.510000000000085 | 0.891 | 0.665 | 0.554 |
| -0.505000000000085 | 0.893 | 0.666 | 0.554 |
| -0.500000000000085 | 0.894 | 0.667 | 0.555 |
| -0.495000000000085 | 0.896 | 0.667 | 0.555 |
| -0.490000000000085 | 0.898 | 0.668 | 0.556 |
| -0.485000000000085 | 0.9 | 0.669 | 0.556 |
| -0.480000000000085 | 0.902 | 0.67 | 0.556 |
| -0.475000000000085 | 0.903 | 0.67 | 0.557 |
| -0.470000000000085 | 0.905 | 0.671 | 0.557 |
| -0.465000000000085 | 0.907 | 0.672 | 0.558 |
| -0.460000000000085 | 0.908 | 0.672 | 0.558 |
| -0.455000000000085 | 0.91 | 0.673 | 0.558 |
| -0.450000000000085 | 0.912 | 0.674 | 0.559 |
| -0.445000000000085 | 0.914 | 0.675 | 0.559 |
| -0.440000000000085 | 0.915 | 0.675 | 0.56 |
| -0.435000000000085 | 0.917 | 0.676 | 0.56 |
| -0.430000000000085 | 0.919 | 0.677 | 0.56 |
| -0.425000000000085 | 0.92 | 0.677 | 0.561 |
| -0.420000000000085 | 0.922 | 0.678 | 0.561 |
| -0.415000000000085 | 0.924 | 0.678 | 0.561 |
| -0.410000000000085 | 0.925 | 0.679 | 0.562 |
| -0.405000000000085 | 0.927 | 0.68 | 0.562 |
| -0.400000000000085 | 0.928 | 0.68 | 0.563 |
| -0.395000000000085 | 0.93 | 0.681 | 0.563 |
| -0.390000000000085 | 0.932 | 0.682 | 0.563 |
| -0.385000000000085 | 0.933 | 0.682 | 0.564 |
| -0.380000000000085 | 0.935 | 0.683 | 0.564 |
| -0.375000000000085 | 0.936 | 0.683 | 0.564 |
| -0.370000000000085 | 0.938 | 0.684 | 0.565 |
| -0.365000000000085 | 0.939 | 0.685 | 0.565 |
| -0.360000000000085 | 0.941 | 0.685 | 0.565 |
| -0.355000000000085 | 0.942 | 0.686 | 0.566 |
| -0.350000000000085 | 0.944 | 0.686 | 0.566 |
| -0.345000000000085 | 0.945 | 0.687 | 0.566 |
| -0.340000000000085 | 0.947 | 0.688 | 0.567 |
| -0.335000000000085 | 0.948 | 0.688 | 0.567 |
| -0.330000000000085 | 0.95 | 0.689 | 0.567 |
| -0.325000000000085 | 0.951 | 0.689 | 0.567 |
| -0.320000000000085 | 0.952 | 0.69 | 0.568 |
| -0.315000000000085 | 0.954 | 0.69 | 0.568 |
| -0.310000000000085 | 0.955 | 0.691 | 0.568 |
| -0.305000000000085 | 0.956 | 0.691 | 0.569 |
| -0.300000000000085 | 0.958 | 0.692 | 0.569 |
| -0.295000000000085 | 0.959 | 0.692 | 0.569 |
| -0.290000000000085 | 0.96 | 0.693 | 0.569 |
| -0.285000000000085 | 0.962 | 0.693 | 0.57 |
| -0.280000000000085 | 0.963 | 0.694 | 0.57 |
| -0.275000000000085 | 0.964 | 0.694 | 0.57 |
| -0.270000000000085 | 0.965 | 0.695 | 0.57 |
| -0.265000000000085 | 0.967 | 0.695 | 0.571 |
| -0.260000000000085 | 0.968 | 0.695 | 0.571 |
| -0.255000000000085 | 0.969 | 0.696 | 0.571 |
| -0.250000000000085 | 0.97 | 0.696 | 0.571 |
| -0.245000000000085 | 0.971 | 0.697 | 0.572 |
| -0.240000000000085 | 0.972 | 0.697 | 0.572 |
| -0.235000000000085 | 0.973 | 0.698 | 0.572 |
| -0.230000000000085 | 0.975 | 0.698 | 0.572 |
| -0.225000000000085 | 0.976 | 0.698 | 0.573 |
| -0.220000000000085 | 0.977 | 0.699 | 0.573 |
| -0.215000000000085 | 0.978 | 0.699 | 0.573 |
| -0.210000000000085 | 0.979 | 0.699 | 0.573 |
| -0.205000000000085 | 0.98 | 0.7 | 0.573 |
| -0.200000000000085 | 0.981 | 0.7 | 0.574 |
| -0.195000000000085 | 0.982 | 0.7 | 0.574 |
| -0.190000000000085 | 0.982 | 0.701 | 0.574 |
| -0.185000000000085 | 0.983 | 0.701 | 0.574 |
| -0.180000000000085 | 0.984 | 0.701 | 0.574 |
| -0.175000000000085 | 0.985 | 0.702 | 0.574 |
| -0.170000000000085 | 0.986 | 0.702 | 0.575 |
| -0.165000000000085 | 0.987 | 0.702 | 0.575 |
| -0.160000000000085 | 0.987 | 0.703 | 0.575 |
| -0.155000000000084 | 0.988 | 0.703 | 0.575 |
| -0.150000000000084 | 0.989 | 0.703 | 0.575 |
| -0.145000000000084 | 0.99 | 0.703 | 0.575 |
| -0.140000000000084 | 0.99 | 0.704 | 0.575 |
| -0.135000000000084 | 0.991 | 0.704 | 0.576 |
| -0.130000000000084 | 0.992 | 0.704 | 0.576 |
| -0.125000000000084 | 0.992 | 0.704 | 0.576 |
| -0.120000000000084 | 0.993 | 0.705 | 0.576 |
| -0.115000000000084 | 0.993 | 0.705 | 0.576 |
| -0.110000000000084 | 0.994 | 0.705 | 0.576 |
| -0.105000000000084 | 0.995 | 0.705 | 0.576 |
| -0.100000000000084 | 0.995 | 0.705 | 0.576 |
| -0.0950000000000844 | 0.996 | 0.706 | 0.576 |
| -0.0900000000000844 | 0.996 | 0.706 | 0.577 |
| -0.0850000000000844 | 0.996 | 0.706 | 0.577 |
| -0.0800000000000844 | 0.997 | 0.706 | 0.577 |
| -0.0750000000000844 | 0.997 | 0.706 | 0.577 |
| -0.0700000000000844 | 0.998 | 0.706 | 0.577 |
| -0.0650000000000844 | 0.998 | 0.706 | 0.577 |
| -0.0600000000000844 | 0.998 | 0.706 | 0.577 |
| -0.0550000000000844 | 0.998 | 0.707 | 0.577 |
| -0.0500000000000844 | 0.999 | 0.707 | 0.577 |
| -0.0450000000000844 | 0.999 | 0.707 | 0.577 |
| -0.0400000000000844 | 0.999 | 0.707 | 0.577 |
| -0.0350000000000844 | 0.999 | 0.707 | 0.577 |
| -0.0300000000000844 | 1 | 0.707 | 0.577 |
| -0.0250000000000844 | 1 | 0.707 | 0.577 |
| -0.0200000000000844 | 1 | 0.707 | 0.577 |
| -0.0150000000000844 | 1 | 0.707 | 0.577 |
| -0.0100000000000844 | 1 | 0.707 | 0.577 |
| -0.00500000000008444 | 1 | 0.707 | 0.577 |
| -8.4444604087075e-14 | 1 | 0.707 | 0.577 |
| 0.00499999999991555 | 1 | 0.707 | 0.577 |
| 0.00999999999991555 | 1 | 0.707 | 0.577 |
| 0.0149999999999156 | 1 | 0.707 | 0.577 |
| 0.0199999999999156 | 1 | 0.707 | 0.577 |
| 0.0249999999999156 | 1 | 0.707 | 0.577 |
| 0.0299999999999156 | 1 | 0.707 | 0.577 |
| 0.0349999999999155 | 0.999 | 0.707 | 0.577 |
| 0.0399999999999155 | 0.999 | 0.707 | 0.577 |
| 0.0449999999999155 | 0.999 | 0.707 | 0.577 |
| 0.0499999999999155 | 0.999 | 0.707 | 0.577 |
| 0.0549999999999155 | 0.998 | 0.707 | 0.577 |
| 0.0599999999999155 | 0.998 | 0.706 | 0.577 |
| 0.0649999999999155 | 0.998 | 0.706 | 0.577 |
| 0.0699999999999155 | 0.998 | 0.706 | 0.577 |
| 0.0749999999999155 | 0.997 | 0.706 | 0.577 |
| 0.0799999999999155 | 0.997 | 0.706 | 0.577 |
| 0.0849999999999155 | 0.996 | 0.706 | 0.577 |
| 0.0899999999999155 | 0.996 | 0.706 | 0.577 |
| 0.0949999999999155 | 0.996 | 0.706 | 0.576 |
| 0.0999999999999155 | 0.995 | 0.705 | 0.576 |
| 0.104999999999916 | 0.995 | 0.705 | 0.576 |
| 0.109999999999916 | 0.994 | 0.705 | 0.576 |
| 0.114999999999916 | 0.993 | 0.705 | 0.576 |
| 0.119999999999916 | 0.993 | 0.705 | 0.576 |
| 0.124999999999916 | 0.992 | 0.704 | 0.576 |
| 0.129999999999916 | 0.992 | 0.704 | 0.576 |
| 0.134999999999916 | 0.991 | 0.704 | 0.576 |
| 0.139999999999916 | 0.99 | 0.704 | 0.575 |
| 0.144999999999916 | 0.99 | 0.703 | 0.575 |
| 0.149999999999916 | 0.989 | 0.703 | 0.575 |
| 0.154999999999916 | 0.988 | 0.703 | 0.575 |
| 0.159999999999916 | 0.987 | 0.703 | 0.575 |
| 0.164999999999916 | 0.987 | 0.702 | 0.575 |
| 0.169999999999916 | 0.986 | 0.702 | 0.575 |
| 0.174999999999916 | 0.985 | 0.702 | 0.574 |
| 0.179999999999916 | 0.984 | 0.701 | 0.574 |
| 0.184999999999916 | 0.983 | 0.701 | 0.574 |
| 0.189999999999916 | 0.982 | 0.701 | 0.574 |
| 0.194999999999916 | 0.982 | 0.7 | 0.574 |
| 0.199999999999916 | 0.981 | 0.7 | 0.574 |
| 0.204999999999916 | 0.98 | 0.7 | 0.573 |
| 0.209999999999916 | 0.979 | 0.699 | 0.573 |
| 0.214999999999916 | 0.978 | 0.699 | 0.573 |
| 0.219999999999916 | 0.977 | 0.699 | 0.573 |
| 0.224999999999916 | 0.976 | 0.698 | 0.573 |
| 0.229999999999916 | 0.975 | 0.698 | 0.572 |
| 0.234999999999916 | 0.973 | 0.698 | 0.572 |
| 0.239999999999916 | 0.972 | 0.697 | 0.572 |
| 0.244999999999916 | 0.971 | 0.697 | 0.572 |
| 0.249999999999916 | 0.97 | 0.696 | 0.571 |
| 0.254999999999916 | 0.969 | 0.696 | 0.571 |
| 0.259999999999916 | 0.968 | 0.695 | 0.571 |
| 0.264999999999916 | 0.967 | 0.695 | 0.571 |
| 0.269999999999916 | 0.965 | 0.695 | 0.57 |
| 0.274999999999916 | 0.964 | 0.694 | 0.57 |
| 0.279999999999916 | 0.963 | 0.694 | 0.57 |
| 0.284999999999916 | 0.962 | 0.693 | 0.57 |
| 0.289999999999916 | 0.96 | 0.693 | 0.569 |
| 0.294999999999916 | 0.959 | 0.692 | 0.569 |
| 0.299999999999916 | 0.958 | 0.692 | 0.569 |
| 0.304999999999916 | 0.956 | 0.691 | 0.569 |
| 0.309999999999916 | 0.955 | 0.691 | 0.568 |
| 0.314999999999916 | 0.954 | 0.69 | 0.568 |
| 0.319999999999916 | 0.952 | 0.69 | 0.568 |
| 0.324999999999916 | 0.951 | 0.689 | 0.567 |
| 0.329999999999916 | 0.95 | 0.689 | 0.567 |
| 0.334999999999916 | 0.948 | 0.688 | 0.567 |
| 0.339999999999916 | 0.947 | 0.688 | 0.567 |
| 0.344999999999916 | 0.945 | 0.687 | 0.566 |
| 0.349999999999916 | 0.944 | 0.686 | 0.566 |
| 0.354999999999916 | 0.942 | 0.686 | 0.566 |
| 0.359999999999916 | 0.941 | 0.685 | 0.565 |
| 0.364999999999916 | 0.939 | 0.685 | 0.565 |
| 0.369999999999916 | 0.938 | 0.684 | 0.565 |
| 0.374999999999916 | 0.936 | 0.683 | 0.564 |
| 0.379999999999916 | 0.935 | 0.683 | 0.564 |
| 0.384999999999916 | 0.933 | 0.682 | 0.564 |
| 0.389999999999916 | 0.932 | 0.682 | 0.563 |
| 0.394999999999916 | 0.93 | 0.681 | 0.563 |
| 0.399999999999916 | 0.928 | 0.68 | 0.563 |
| 0.404999999999916 | 0.927 | 0.68 | 0.562 |
| 0.409999999999916 | 0.925 | 0.679 | 0.562 |
| 0.414999999999916 | 0.924 | 0.678 | 0.561 |
| 0.419999999999916 | 0.922 | 0.678 | 0.561 |
| 0.424999999999916 | 0.92 | 0.677 | 0.561 |
| 0.429999999999916 | 0.919 | 0.677 | 0.56 |
| 0.434999999999916 | 0.917 | 0.676 | 0.56 |
| 0.439999999999916 | 0.915 | 0.675 | 0.56 |
| 0.444999999999916 | 0.914 | 0.675 | 0.559 |
| 0.449999999999916 | 0.912 | 0.674 | 0.559 |
| 0.454999999999916 | 0.91 | 0.673 | 0.558 |
| 0.459999999999916 | 0.908 | 0.672 | 0.558 |
| 0.464999999999916 | 0.907 | 0.672 | 0.558 |
| 0.469999999999916 | 0.905 | 0.671 | 0.557 |
| 0.474999999999916 | 0.903 | 0.67 | 0.557 |
| 0.479999999999916 | 0.902 | 0.67 | 0.556 |
| 0.484999999999916 | 0.9 | 0.669 | 0.556 |
| 0.489999999999916 | 0.898 | 0.668 | 0.556 |
| 0.494999999999916 | 0.896 | 0.667 | 0.555 |
| 0.499999999999916 | 0.894 | 0.667 | 0.555 |
| 0.504999999999916 | 0.893 | 0.666 | 0.554 |
| 0.509999999999916 | 0.891 | 0.665 | 0.554 |
| 0.514999999999916 | 0.889 | 0.664 | 0.553 |
| 0.519999999999916 | 0.887 | 0.664 | 0.553 |
| 0.524999999999916 | 0.885 | 0.663 | 0.553 |
| 0.529999999999916 | 0.884 | 0.662 | 0.552 |
| 0.534999999999916 | 0.882 | 0.661 | 0.552 |
| 0.539999999999916 | 0.88 | 0.661 | 0.551 |
| 0.544999999999916 | 0.878 | 0.66 | 0.551 |
| 0.549999999999916 | 0.876 | 0.659 | 0.55 |
| 0.554999999999916 | 0.874 | 0.658 | 0.55 |
| 0.559999999999916 | 0.873 | 0.657 | 0.549 |
| 0.564999999999916 | 0.871 | 0.657 | 0.549 |
| 0.569999999999916 | 0.869 | 0.656 | 0.548 |
| 0.574999999999916 | 0.867 | 0.655 | 0.548 |
| 0.579999999999916 | 0.865 | 0.654 | 0.547 |
| 0.584999999999916 | 0.863 | 0.653 | 0.547 |
| 0.589999999999916 | 0.861 | 0.653 | 0.547 |
| 0.594999999999916 | 0.859 | 0.652 | 0.546 |
| 0.599999999999916 | 0.857 | 0.651 | 0.546 |
| 0.604999999999916 | 0.856 | 0.65 | 0.545 |
| 0.609999999999916 | 0.854 | 0.649 | 0.545 |
| 0.614999999999916 | 0.852 | 0.648 | 0.544 |
| 0.619999999999916 | 0.85 | 0.648 | 0.544 |
| 0.624999999999916 | 0.848 | 0.647 | 0.543 |
| 0.629999999999916 | 0.846 | 0.646 | 0.543 |
| 0.634999999999916 | 0.844 | 0.645 | 0.542 |
| 0.639999999999916 | 0.842 | 0.644 | 0.542 |
| 0.644999999999916 | 0.84 | 0.643 | 0.541 |
| 0.649999999999916 | 0.838 | 0.642 | 0.541 |
| 0.654999999999916 | 0.837 | 0.642 | 0.54 |
| 0.659999999999916 | 0.835 | 0.641 | 0.54 |
| 0.664999999999916 | 0.833 | 0.64 | 0.539 |
| 0.669999999999916 | 0.831 | 0.639 | 0.538 |
| 0.674999999999916 | 0.829 | 0.638 | 0.538 |
| 0.679999999999916 | 0.827 | 0.637 | 0.537 |
| 0.684999999999916 | 0.825 | 0.636 | 0.537 |
| 0.689999999999916 | 0.823 | 0.636 | 0.536 |
| 0.694999999999916 | 0.821 | 0.635 | 0.536 |
| 0.699999999999916 | 0.819 | 0.634 | 0.535 |
| 0.704999999999916 | 0.817 | 0.633 | 0.535 |
| 0.709999999999916 | 0.815 | 0.632 | 0.534 |
| 0.714999999999916 | 0.813 | 0.631 | 0.534 |
| 0.719999999999916 | 0.812 | 0.63 | 0.533 |
| 0.724999999999916 | 0.81 | 0.629 | 0.533 |
| 0.729999999999916 | 0.808 | 0.628 | 0.532 |
| 0.734999999999916 | 0.806 | 0.627 | 0.531 |
| 0.739999999999916 | 0.804 | 0.627 | 0.531 |
| 0.744999999999916 | 0.802 | 0.626 | 0.53 |
| 0.749999999999916 | 0.8 | 0.625 | 0.53 |
| 0.754999999999916 | 0.798 | 0.624 | 0.529 |
| 0.759999999999916 | 0.796 | 0.623 | 0.529 |
| 0.764999999999916 | 0.794 | 0.622 | 0.528 |
| 0.769999999999916 | 0.792 | 0.621 | 0.528 |
| 0.774999999999916 | 0.79 | 0.62 | 0.527 |
| 0.779999999999916 | 0.789 | 0.619 | 0.526 |
| 0.784999999999916 | 0.787 | 0.618 | 0.526 |
| 0.789999999999916 | 0.785 | 0.617 | 0.525 |
| 0.794999999999916 | 0.783 | 0.616 | 0.525 |
| 0.799999999999916 | 0.781 | 0.615 | 0.524 |
| 0.804999999999916 | 0.779 | 0.615 | 0.524 |
| 0.809999999999916 | 0.777 | 0.614 | 0.523 |
| 0.814999999999916 | 0.775 | 0.613 | 0.522 |
| 0.819999999999916 | 0.773 | 0.612 | 0.522 |
| 0.824999999999916 | 0.771 | 0.611 | 0.521 |
| 0.829999999999916 | 0.769 | 0.61 | 0.521 |
| 0.834999999999916 | 0.768 | 0.609 | 0.52 |
| 0.839999999999916 | 0.766 | 0.608 | 0.519 |
| 0.844999999999916 | 0.764 | 0.607 | 0.519 |
| 0.849999999999916 | 0.762 | 0.606 | 0.518 |
| 0.854999999999916 | 0.76 | 0.605 | 0.518 |
| 0.859999999999916 | 0.758 | 0.604 | 0.517 |
| 0.864999999999916 | 0.756 | 0.603 | 0.517 |
| 0.869999999999916 | 0.754 | 0.602 | 0.516 |
| 0.874999999999916 | 0.753 | 0.601 | 0.515 |
| 0.879999999999916 | 0.751 | 0.6 | 0.515 |
| 0.884999999999916 | 0.749 | 0.599 | 0.514 |
| 0.889999999999916 | 0.747 | 0.598 | 0.514 |
| 0.894999999999916 | 0.745 | 0.598 | 0.513 |
| 0.899999999999916 | 0.743 | 0.597 | 0.512 |
| 0.904999999999916 | 0.741 | 0.596 | 0.512 |
| 0.909999999999916 | 0.74 | 0.595 | 0.511 |
| 0.914999999999916 | 0.738 | 0.594 | 0.51 |
| 0.919999999999916 | 0.736 | 0.593 | 0.51 |
| 0.924999999999916 | 0.734 | 0.592 | 0.509 |
| 0.929999999999916 | 0.732 | 0.591 | 0.509 |
| 0.934999999999916 | 0.73 | 0.59 | 0.508 |
| 0.939999999999916 | 0.729 | 0.589 | 0.507 |
| 0.944999999999916 | 0.727 | 0.588 | 0.507 |
| 0.949999999999916 | 0.725 | 0.587 | 0.506 |
| 0.954999999999916 | 0.723 | 0.586 | 0.506 |
| 0.959999999999916 | 0.721 | 0.585 | 0.505 |
| 0.964999999999916 | 0.72 | 0.584 | 0.504 |
| 0.969999999999916 | 0.718 | 0.583 | 0.504 |
| 0.974999999999916 | 0.716 | 0.582 | 0.503 |
| 0.979999999999916 | 0.714 | 0.581 | 0.502 |
| 0.984999999999916 | 0.712 | 0.58 | 0.502 |
| 0.989999999999916 | 0.711 | 0.579 | 0.501 |
| 0.994999999999916 | 0.709 | 0.578 | 0.501 |
| 0.999999999999916 | 0.707 | 0.577 | 0.5 |
| 1.004999999999916 | 0.705 | 0.576 | 0.499 |
| 1.009999999999916 | 0.704 | 0.575 | 0.499 |
| 1.014999999999916 | 0.702 | 0.574 | 0.498 |
| 1.019999999999916 | 0.7 | 0.574 | 0.497 |
| 1.024999999999916 | 0.698 | 0.573 | 0.497 |
| 1.029999999999916 | 0.697 | 0.572 | 0.496 |
| 1.034999999999916 | 0.695 | 0.571 | 0.496 |
| 1.039999999999915 | 0.693 | 0.57 | 0.495 |
| 1.044999999999915 | 0.691 | 0.569 | 0.494 |
| 1.049999999999915 | 0.69 | 0.568 | 0.494 |
| 1.054999999999915 | 0.688 | 0.567 | 0.493 |
| 1.059999999999915 | 0.686 | 0.566 | 0.492 |
| 1.064999999999915 | 0.685 | 0.565 | 0.492 |
| 1.069999999999915 | 0.683 | 0.564 | 0.491 |
| 1.074999999999915 | 0.681 | 0.563 | 0.491 |
| 1.079999999999915 | 0.679 | 0.562 | 0.49 |
| 1.084999999999914 | 0.678 | 0.561 | 0.489 |
| 1.089999999999914 | 0.676 | 0.56 | 0.489 |
| 1.094999999999914 | 0.674 | 0.559 | 0.488 |
| 1.099999999999914 | 0.673 | 0.558 | 0.487 |
| 1.104999999999914 | 0.671 | 0.557 | 0.487 |
| 1.109999999999914 | 0.669 | 0.556 | 0.486 |
| 1.114999999999914 | 0.668 | 0.555 | 0.485 |
| 1.119999999999914 | 0.666 | 0.554 | 0.485 |
| 1.124999999999914 | 0.664 | 0.553 | 0.484 |
| 1.129999999999914 | 0.663 | 0.552 | 0.484 |
| 1.134999999999913 | 0.661 | 0.551 | 0.483 |
| 1.139999999999913 | 0.659 | 0.551 | 0.482 |
| 1.144999999999913 | 0.658 | 0.55 | 0.482 |
| 1.149999999999913 | 0.656 | 0.549 | 0.481 |
| 1.154999999999913 | 0.655 | 0.548 | 0.48 |
| 1.159999999999913 | 0.653 | 0.547 | 0.48 |
| 1.164999999999913 | 0.651 | 0.546 | 0.479 |
| 1.169999999999913 | 0.65 | 0.545 | 0.478 |
| 1.174999999999913 | 0.648 | 0.544 | 0.478 |
| 1.179999999999912 | 0.647 | 0.543 | 0.477 |
| 1.184999999999912 | 0.645 | 0.542 | 0.477 |
| 1.189999999999912 | 0.643 | 0.541 | 0.476 |
| 1.194999999999912 | 0.642 | 0.54 | 0.475 |
| 1.199999999999912 | 0.64 | 0.539 | 0.475 |
| 1.204999999999912 | 0.639 | 0.538 | 0.474 |
| 1.209999999999912 | 0.637 | 0.537 | 0.473 |
| 1.214999999999912 | 0.635 | 0.536 | 0.473 |
| 1.219999999999912 | 0.634 | 0.535 | 0.472 |
| 1.224999999999911 | 0.632 | 0.534 | 0.471 |
| 1.229999999999911 | 0.631 | 0.534 | 0.471 |
| 1.234999999999911 | 0.629 | 0.533 | 0.47 |
| 1.239999999999911 | 0.628 | 0.532 | 0.469 |
| 1.244999999999911 | 0.626 | 0.531 | 0.469 |
| 1.249999999999911 | 0.625 | 0.53 | 0.468 |
| 1.254999999999911 | 0.623 | 0.529 | 0.468 |
| 1.259999999999911 | 0.622 | 0.528 | 0.467 |
| 1.264999999999911 | 0.62 | 0.527 | 0.466 |
| 1.269999999999911 | 0.619 | 0.526 | 0.466 |
| 1.27499999999991 | 0.617 | 0.525 | 0.465 |
| 1.27999999999991 | 0.616 | 0.524 | 0.464 |
| 1.28499999999991 | 0.614 | 0.523 | 0.464 |
| 1.28999999999991 | 0.613 | 0.522 | 0.463 |
| 1.29499999999991 | 0.611 | 0.521 | 0.462 |
| 1.29999999999991 | 0.61 | 0.521 | 0.462 |
| 1.30499999999991 | 0.608 | 0.52 | 0.461 |
| 1.30999999999991 | 0.607 | 0.519 | 0.46 |
| 1.31499999999991 | 0.605 | 0.518 | 0.46 |
| 1.319999999999909 | 0.604 | 0.517 | 0.459 |
| 1.324999999999909 | 0.602 | 0.516 | 0.459 |
| 1.329999999999909 | 0.601 | 0.515 | 0.458 |
| 1.334999999999909 | 0.6 | 0.514 | 0.457 |
| 1.339999999999909 | 0.598 | 0.513 | 0.457 |
| 1.344999999999909 | 0.597 | 0.512 | 0.456 |
| 1.349999999999909 | 0.595 | 0.511 | 0.455 |
| 1.354999999999909 | 0.594 | 0.511 | 0.455 |
| 1.359999999999909 | 0.592 | 0.51 | 0.454 |
| 1.364999999999908 | 0.591 | 0.509 | 0.453 |
| 1.369999999999908 | 0.59 | 0.508 | 0.453 |
| 1.374999999999908 | 0.588 | 0.507 | 0.452 |
| 1.379999999999908 | 0.587 | 0.506 | 0.452 |
| 1.384999999999908 | 0.585 | 0.505 | 0.451 |
| 1.389999999999908 | 0.584 | 0.504 | 0.45 |
| 1.394999999999908 | 0.583 | 0.503 | 0.45 |
| 1.399999999999908 | 0.581 | 0.503 | 0.449 |
| 1.404999999999908 | 0.58 | 0.502 | 0.448 |
| 1.409999999999908 | 0.578 | 0.501 | 0.448 |
| 1.414999999999907 | 0.577 | 0.5 | 0.447 |
| 1.419999999999907 | 0.576 | 0.499 | 0.446 |
| 1.424999999999907 | 0.574 | 0.498 | 0.446 |
| 1.429999999999907 | 0.573 | 0.497 | 0.445 |
| 1.434999999999907 | 0.572 | 0.496 | 0.445 |
| 1.439999999999907 | 0.57 | 0.495 | 0.444 |
| 1.444999999999907 | 0.569 | 0.495 | 0.443 |
| 1.449999999999907 | 0.568 | 0.494 | 0.443 |
| 1.454999999999907 | 0.566 | 0.493 | 0.442 |
| 1.459999999999906 | 0.565 | 0.492 | 0.441 |
| 1.464999999999906 | 0.564 | 0.491 | 0.441 |
| 1.469999999999906 | 0.562 | 0.49 | 0.44 |
| 1.474999999999906 | 0.561 | 0.489 | 0.44 |
| 1.479999999999906 | 0.56 | 0.489 | 0.439 |
| 1.484999999999906 | 0.559 | 0.488 | 0.438 |
| 1.489999999999906 | 0.557 | 0.487 | 0.438 |
| 1.494999999999906 | 0.556 | 0.486 | 0.437 |
| 1.499999999999906 | 0.555 | 0.485 | 0.436 |
| 1.504999999999906 | 0.553 | 0.484 | 0.436 |
| 1.509999999999905 | 0.552 | 0.483 | 0.435 |
| 1.514999999999905 | 0.551 | 0.483 | 0.435 |
| 1.519999999999905 | 0.55 | 0.482 | 0.434 |
| 1.524999999999905 | 0.548 | 0.481 | 0.433 |
| 1.529999999999905 | 0.547 | 0.48 | 0.433 |
| 1.534999999999905 | 0.546 | 0.479 | 0.432 |
| 1.539999999999905 | 0.545 | 0.478 | 0.431 |
| 1.544999999999905 | 0.543 | 0.477 | 0.431 |
| 1.549999999999905 | 0.542 | 0.477 | 0.43 |
| 1.554999999999904 | 0.541 | 0.476 | 0.43 |
| 1.559999999999904 | 0.54 | 0.475 | 0.429 |
| 1.564999999999904 | 0.538 | 0.474 | 0.428 |
| 1.569999999999904 | 0.537 | 0.473 | 0.428 |
| 1.574999999999904 | 0.536 | 0.472 | 0.427 |
| 1.579999999999904 | 0.535 | 0.472 | 0.427 |
| 1.584999999999904 | 0.534 | 0.471 | 0.426 |
| 1.589999999999904 | 0.532 | 0.47 | 0.425 |
| 1.594999999999904 | 0.531 | 0.469 | 0.425 |
| 1.599999999999903 | 0.53 | 0.468 | 0.424 |
| 1.604999999999903 | 0.529 | 0.467 | 0.423 |
| 1.609999999999903 | 0.528 | 0.467 | 0.423 |
| 1.614999999999903 | 0.526 | 0.466 | 0.422 |
| 1.619999999999903 | 0.525 | 0.465 | 0.422 |
| 1.624999999999903 | 0.524 | 0.464 | 0.421 |
| 1.629999999999903 | 0.523 | 0.463 | 0.42 |
| 1.634999999999903 | 0.522 | 0.463 | 0.42 |
| 1.639999999999903 | 0.521 | 0.462 | 0.419 |
| 1.644999999999902 | 0.519 | 0.461 | 0.419 |
| 1.649999999999902 | 0.518 | 0.46 | 0.418 |
| 1.654999999999902 | 0.517 | 0.459 | 0.417 |
| 1.659999999999902 | 0.516 | 0.459 | 0.417 |
| 1.664999999999902 | 0.515 | 0.458 | 0.416 |
| 1.669999999999902 | 0.514 | 0.457 | 0.416 |
| 1.674999999999902 | 0.513 | 0.456 | 0.415 |
| 1.679999999999902 | 0.511 | 0.455 | 0.414 |
| 1.684999999999902 | 0.51 | 0.455 | 0.414 |
| 1.689999999999901 | 0.509 | 0.454 | 0.413 |
| 1.694999999999901 | 0.508 | 0.453 | 0.413 |
| 1.699999999999901 | 0.507 | 0.452 | 0.412 |
| 1.704999999999901 | 0.506 | 0.451 | 0.411 |
| 1.709999999999901 | 0.505 | 0.451 | 0.411 |
| 1.714999999999901 | 0.504 | 0.45 | 0.41 |
| 1.719999999999901 | 0.503 | 0.449 | 0.41 |
| 1.724999999999901 | 0.502 | 0.448 | 0.409 |
| 1.729999999999901 | 0.5 | 0.448 | 0.408 |
| 1.734999999999901 | 0.499 | 0.447 | 0.408 |
| 1.7399999999999 | 0.498 | 0.446 | 0.407 |
| 1.7449999999999 | 0.497 | 0.445 | 0.407 |
| 1.7499999999999 | 0.496 | 0.444 | 0.406 |
| 1.7549999999999 | 0.495 | 0.444 | 0.406 |
| 1.7599999999999 | 0.494 | 0.443 | 0.405 |
| 1.7649999999999 | 0.493 | 0.442 | 0.404 |
| 1.7699999999999 | 0.492 | 0.441 | 0.404 |
| 1.7749999999999 | 0.491 | 0.441 | 0.403 |
| 1.7799999999999 | 0.49 | 0.44 | 0.403 |
| 1.784999999999899 | 0.489 | 0.439 | 0.402 |
| 1.789999999999899 | 0.488 | 0.438 | 0.401 |
| 1.794999999999899 | 0.487 | 0.438 | 0.401 |
| 1.799999999999899 | 0.486 | 0.437 | 0.4 |
| 1.804999999999899 | 0.485 | 0.436 | 0.4 |
| 1.809999999999899 | 0.484 | 0.435 | 0.399 |
| 1.814999999999899 | 0.483 | 0.435 | 0.399 |
| 1.819999999999899 | 0.482 | 0.434 | 0.398 |
| 1.824999999999899 | 0.481 | 0.433 | 0.397 |
| 1.829999999999899 | 0.48 | 0.432 | 0.397 |
| 1.834999999999898 | 0.479 | 0.432 | 0.396 |
| 1.839999999999898 | 0.478 | 0.431 | 0.396 |
| 1.844999999999898 | 0.477 | 0.43 | 0.395 |
| 1.849999999999898 | 0.476 | 0.429 | 0.395 |
| 1.854999999999898 | 0.475 | 0.429 | 0.394 |
| 1.859999999999898 | 0.474 | 0.428 | 0.393 |
| 1.864999999999898 | 0.473 | 0.427 | 0.393 |
| 1.869999999999898 | 0.472 | 0.427 | 0.392 |
| 1.874999999999898 | 0.471 | 0.426 | 0.392 |
| 1.879999999999897 | 0.47 | 0.425 | 0.391 |
| 1.884999999999897 | 0.469 | 0.424 | 0.391 |
| 1.889999999999897 | 0.468 | 0.424 | 0.39 |
| 1.894999999999897 | 0.467 | 0.423 | 0.39 |
| 1.899999999999897 | 0.466 | 0.422 | 0.389 |
| 1.904999999999897 | 0.465 | 0.421 | 0.388 |
| 1.909999999999897 | 0.464 | 0.421 | 0.388 |
| 1.914999999999897 | 0.463 | 0.42 | 0.387 |
| 1.919999999999897 | 0.462 | 0.419 | 0.387 |
| 1.924999999999897 | 0.461 | 0.419 | 0.386 |
| 1.929999999999896 | 0.46 | 0.418 | 0.386 |
| 1.934999999999896 | 0.459 | 0.417 | 0.385 |
| 1.939999999999896 | 0.458 | 0.417 | 0.385 |
| 1.944999999999896 | 0.457 | 0.416 | 0.384 |
| 1.949999999999896 | 0.456 | 0.415 | 0.383 |
| 1.954999999999896 | 0.455 | 0.414 | 0.383 |
| 1.959999999999896 | 0.454 | 0.414 | 0.382 |
| 1.964999999999896 | 0.454 | 0.413 | 0.382 |
| 1.969999999999896 | 0.453 | 0.412 | 0.381 |
| 1.974999999999895 | 0.452 | 0.412 | 0.381 |
| 1.979999999999895 | 0.451 | 0.411 | 0.38 |
| 1.984999999999895 | 0.45 | 0.41 | 0.38 |
| 1.989999999999895 | 0.449 | 0.41 | 0.379 |
| 1.994999999999895 | 0.448 | 0.409 | 0.379 |
| 1.999999999999895 | 0.447 | 0.408 | 0.378 |
| 2.004999999999895 | 0.446 | 0.408 | 0.377 |
| 2.009999999999895 | 0.445 | 0.407 | 0.377 |
| 2.014999999999895 | 0.445 | 0.406 | 0.376 |
| 2.019999999999895 | 0.444 | 0.406 | 0.376 |
| 2.024999999999895 | 0.443 | 0.405 | 0.375 |
| 2.029999999999895 | 0.442 | 0.404 | 0.375 |
| 2.034999999999894 | 0.441 | 0.404 | 0.374 |
| 2.039999999999894 | 0.44 | 0.403 | 0.374 |
| 2.044999999999894 | 0.439 | 0.402 | 0.373 |
| 2.049999999999894 | 0.438 | 0.402 | 0.373 |
| 2.054999999999894 | 0.438 | 0.401 | 0.372 |
| 2.059999999999894 | 0.437 | 0.4 | 0.372 |
| 2.064999999999894 | 0.436 | 0.4 | 0.371 |
| 2.069999999999894 | 0.435 | 0.399 | 0.37 |
| 2.074999999999894 | 0.434 | 0.398 | 0.37 |
| 2.079999999999893 | 0.433 | 0.398 | 0.369 |
| 2.084999999999893 | 0.432 | 0.397 | 0.369 |
| 2.089999999999893 | 0.432 | 0.396 | 0.368 |
| 2.094999999999893 | 0.431 | 0.396 | 0.368 |
| 2.099999999999893 | 0.43 | 0.395 | 0.367 |
| 2.104999999999893 | 0.429 | 0.394 | 0.367 |
| 2.109999999999893 | 0.428 | 0.394 | 0.366 |
| 2.114999999999893 | 0.427 | 0.393 | 0.366 |
| 2.119999999999893 | 0.427 | 0.392 | 0.365 |
| 2.124999999999893 | 0.426 | 0.392 | 0.365 |
| 2.129999999999892 | 0.425 | 0.391 | 0.364 |
| 2.134999999999892 | 0.424 | 0.39 | 0.364 |
| 2.139999999999892 | 0.423 | 0.39 | 0.363 |
| 2.144999999999892 | 0.423 | 0.389 | 0.363 |
| 2.149999999999892 | 0.422 | 0.389 | 0.362 |
| 2.154999999999892 | 0.421 | 0.388 | 0.362 |
| 2.159999999999892 | 0.42 | 0.387 | 0.361 |
| 2.164999999999892 | 0.419 | 0.387 | 0.361 |
| 2.169999999999892 | 0.419 | 0.386 | 0.36 |
| 2.174999999999891 | 0.418 | 0.385 | 0.36 |
| 2.179999999999891 | 0.417 | 0.385 | 0.359 |
| 2.184999999999891 | 0.416 | 0.384 | 0.359 |
| 2.189999999999891 | 0.415 | 0.384 | 0.358 |
| 2.194999999999891 | 0.415 | 0.383 | 0.358 |
| 2.199999999999891 | 0.414 | 0.382 | 0.357 |
| 2.204999999999891 | 0.413 | 0.382 | 0.357 |
| 2.209999999999891 | 0.412 | 0.381 | 0.356 |
| 2.214999999999891 | 0.411 | 0.381 | 0.356 |
| 2.21999999999989 | 0.411 | 0.38 | 0.355 |
| 2.22499999999989 | 0.41 | 0.379 | 0.355 |
| 2.22999999999989 | 0.409 | 0.379 | 0.354 |
| 2.23499999999989 | 0.408 | 0.378 | 0.354 |
| 2.23999999999989 | 0.408 | 0.377 | 0.353 |
| 2.24499999999989 | 0.407 | 0.377 | 0.353 |
| 2.24999999999989 | 0.406 | 0.376 | 0.352 |
| 2.25499999999989 | 0.405 | 0.376 | 0.352 |
| 2.25999999999989 | 0.405 | 0.375 | 0.351 |
| 2.26499999999989 | 0.404 | 0.374 | 0.351 |
| 2.269999999999889 | 0.403 | 0.374 | 0.35 |
| 2.274999999999889 | 0.402 | 0.373 | 0.35 |
| 2.279999999999889 | 0.402 | 0.373 | 0.349 |
| 2.284999999999889 | 0.401 | 0.372 | 0.349 |
| 2.289999999999889 | 0.4 | 0.372 | 0.348 |
| 2.294999999999889 | 0.399 | 0.371 | 0.348 |
| 2.299999999999889 | 0.399 | 0.37 | 0.347 |
| 2.304999999999889 | 0.398 | 0.37 | 0.347 |
| 2.309999999999889 | 0.397 | 0.369 | 0.346 |
| 2.314999999999888 | 0.397 | 0.369 | 0.346 |
| 2.319999999999888 | 0.396 | 0.368 | 0.345 |
| 2.324999999999888 | 0.395 | 0.367 | 0.345 |
| 2.329999999999888 | 0.394 | 0.367 | 0.344 |
| 2.334999999999888 | 0.394 | 0.366 | 0.344 |
| 2.339999999999888 | 0.393 | 0.366 | 0.343 |
| 2.344999999999888 | 0.392 | 0.365 | 0.343 |
| 2.349999999999888 | 0.392 | 0.365 | 0.343 |
| 2.354999999999888 | 0.391 | 0.364 | 0.342 |
| 2.359999999999887 | 0.39 | 0.363 | 0.342 |
| 2.364999999999887 | 0.389 | 0.363 | 0.341 |
| 2.369999999999887 | 0.389 | 0.362 | 0.341 |
| 2.374999999999887 | 0.388 | 0.362 | 0.34 |
| 2.379999999999887 | 0.387 | 0.361 | 0.34 |
| 2.384999999999887 | 0.387 | 0.361 | 0.339 |
| 2.389999999999887 | 0.386 | 0.36 | 0.339 |
| 2.394999999999887 | 0.385 | 0.36 | 0.338 |
| 2.399999999999887 | 0.385 | 0.359 | 0.338 |
| 2.404999999999887 | 0.384 | 0.358 | 0.337 |
| 2.409999999999886 | 0.383 | 0.358 | 0.337 |
| 2.414999999999886 | 0.383 | 0.357 | 0.336 |
| 2.419999999999886 | 0.382 | 0.357 | 0.336 |
| 2.424999999999886 | 0.381 | 0.356 | 0.336 |
| 2.429999999999886 | 0.381 | 0.356 | 0.335 |
| 2.434999999999886 | 0.38 | 0.355 | 0.335 |
| 2.439999999999886 | 0.379 | 0.355 | 0.334 |
| 2.444999999999886 | 0.379 | 0.354 | 0.334 |
| 2.449999999999886 | 0.378 | 0.353 | 0.333 |
| 2.454999999999885 | 0.377 | 0.353 | 0.333 |
| 2.459999999999885 | 0.377 | 0.352 | 0.332 |
| 2.464999999999885 | 0.376 | 0.352 | 0.332 |
| 2.469999999999885 | 0.375 | 0.351 | 0.331 |
| 2.474999999999885 | 0.375 | 0.351 | 0.331 |
| 2.479999999999885 | 0.374 | 0.35 | 0.331 |
| 2.484999999999885 | 0.373 | 0.35 | 0.33 |
| 2.489999999999885 | 0.373 | 0.349 | 0.33 |
| 2.494999999999885 | 0.372 | 0.349 | 0.329 |
| 2.499999999999884 | 0.371 | 0.348 | 0.329 |
| 2.504999999999884 | 0.371 | 0.348 | 0.328 |
| 2.509999999999884 | 0.37 | 0.347 | 0.328 |
| 2.514999999999884 | 0.369 | 0.347 | 0.327 |
| 2.519999999999884 | 0.369 | 0.346 | 0.327 |
| 2.524999999999884 | 0.368 | 0.346 | 0.327 |
| 2.529999999999884 | 0.368 | 0.345 | 0.326 |
| 2.534999999999884 | 0.367 | 0.344 | 0.326 |
| 2.539999999999884 | 0.366 | 0.344 | 0.325 |
| 2.544999999999884 | 0.366 | 0.343 | 0.325 |
| 2.549999999999883 | 0.365 | 0.343 | 0.324 |
| 2.554999999999883 | 0.364 | 0.342 | 0.324 |
| 2.559999999999883 | 0.364 | 0.342 | 0.324 |
| 2.564999999999883 | 0.363 | 0.341 | 0.323 |
| 2.569999999999883 | 0.363 | 0.341 | 0.323 |
| 2.574999999999883 | 0.362 | 0.34 | 0.322 |
| 2.579999999999883 | 0.361 | 0.34 | 0.322 |
| 2.584999999999883 | 0.361 | 0.339 | 0.321 |
| 2.589999999999883 | 0.36 | 0.339 | 0.321 |
| 2.594999999999882 | 0.36 | 0.338 | 0.321 |
| 2.599999999999882 | 0.359 | 0.338 | 0.32 |
| 2.604999999999882 | 0.358 | 0.337 | 0.32 |
| 2.609999999999882 | 0.358 | 0.337 | 0.319 |
| 2.614999999999882 | 0.357 | 0.336 | 0.319 |
| 2.619999999999882 | 0.357 | 0.336 | 0.318 |
| 2.624999999999882 | 0.356 | 0.335 | 0.318 |
| 2.629999999999882 | 0.355 | 0.335 | 0.318 |
| 2.634999999999882 | 0.355 | 0.334 | 0.317 |
| 2.639999999999881 | 0.354 | 0.334 | 0.317 |
| 2.644999999999881 | 0.354 | 0.333 | 0.316 |
| 2.649999999999881 | 0.353 | 0.333 | 0.316 |
| 2.654999999999881 | 0.352 | 0.332 | 0.315 |
| 2.659999999999881 | 0.352 | 0.332 | 0.315 |
| 2.664999999999881 | 0.351 | 0.331 | 0.315 |
| 2.669999999999881 | 0.351 | 0.331 | 0.314 |
| 2.674999999999881 | 0.35 | 0.33 | 0.314 |
| 2.679999999999881 | 0.35 | 0.33 | 0.313 |
| 2.68499999999988 | 0.349 | 0.33 | 0.313 |
| 2.68999999999988 | 0.348 | 0.329 | 0.313 |
| 2.69499999999988 | 0.348 | 0.329 | 0.312 |
| 2.69999999999988 | 0.347 | 0.328 | 0.312 |
| 2.70499999999988 | 0.347 | 0.328 | 0.311 |
| 2.70999999999988 | 0.346 | 0.327 | 0.311 |
| 2.71499999999988 | 0.346 | 0.327 | 0.311 |
| 2.71999999999988 | 0.345 | 0.326 | 0.31 |
| 2.72499999999988 | 0.345 | 0.326 | 0.31 |
| 2.72999999999988 | 0.344 | 0.325 | 0.309 |
| 2.734999999999879 | 0.343 | 0.325 | 0.309 |
| 2.739999999999879 | 0.343 | 0.324 | 0.308 |
| 2.744999999999879 | 0.342 | 0.324 | 0.308 |
| 2.749999999999879 | 0.342 | 0.323 | 0.308 |
| 2.754999999999879 | 0.341 | 0.323 | 0.307 |
| 2.759999999999879 | 0.341 | 0.322 | 0.307 |
| 2.764999999999879 | 0.34 | 0.322 | 0.306 |
| 2.769999999999879 | 0.34 | 0.322 | 0.306 |
| 2.774999999999879 | 0.339 | 0.321 | 0.306 |
| 2.779999999999878 | 0.338 | 0.321 | 0.305 |
| 2.784999999999878 | 0.338 | 0.32 | 0.305 |
| 2.789999999999878 | 0.337 | 0.32 | 0.305 |
| 2.794999999999878 | 0.337 | 0.319 | 0.304 |
| 2.799999999999878 | 0.336 | 0.319 | 0.304 |
| 2.804999999999878 | 0.336 | 0.318 | 0.303 |
| 2.809999999999878 | 0.335 | 0.318 | 0.303 |
| 2.814999999999878 | 0.335 | 0.317 | 0.303 |
| 2.819999999999878 | 0.334 | 0.317 | 0.302 |
| 2.824999999999878 | 0.334 | 0.317 | 0.302 |
| 2.829999999999877 | 0.333 | 0.316 | 0.301 |
| 2.834999999999877 | 0.333 | 0.316 | 0.301 |
| 2.839999999999877 | 0.332 | 0.315 | 0.301 |
| 2.844999999999877 | 0.332 | 0.315 | 0.3 |
| 2.849999999999877 | 0.331 | 0.314 | 0.3 |
| 2.854999999999877 | 0.331 | 0.314 | 0.299 |
| 2.859999999999877 | 0.33 | 0.313 | 0.299 |
| 2.864999999999877 | 0.33 | 0.313 | 0.299 |
| 2.869999999999877 | 0.329 | 0.313 | 0.298 |
| 2.874999999999876 | 0.329 | 0.312 | 0.298 |
| 2.879999999999876 | 0.328 | 0.312 | 0.298 |
| 2.884999999999876 | 0.328 | 0.311 | 0.297 |
| 2.889999999999876 | 0.327 | 0.311 | 0.297 |
| 2.894999999999876 | 0.326 | 0.31 | 0.296 |
| 2.899999999999876 | 0.326 | 0.31 | 0.296 |
| 2.904999999999876 | 0.325 | 0.31 | 0.296 |
| 2.909999999999876 | 0.325 | 0.309 | 0.295 |
| 2.914999999999876 | 0.324 | 0.309 | 0.295 |
| 2.919999999999876 | 0.324 | 0.308 | 0.295 |
| 2.924999999999875 | 0.323 | 0.308 | 0.294 |
| 2.929999999999875 | 0.323 | 0.307 | 0.294 |
| 2.934999999999875 | 0.323 | 0.307 | 0.293 |
| 2.939999999999875 | 0.322 | 0.307 | 0.293 |
| 2.944999999999875 | 0.322 | 0.306 | 0.293 |
| 2.949999999999875 | 0.321 | 0.306 | 0.292 |
| 2.954999999999875 | 0.321 | 0.305 | 0.292 |
| 2.959999999999875 | 0.32 | 0.305 | 0.292 |
| 2.964999999999875 | 0.32 | 0.304 | 0.291 |
| 2.969999999999874 | 0.319 | 0.304 | 0.291 |
| 2.974999999999874 | 0.319 | 0.304 | 0.29 |
| 2.979999999999874 | 0.318 | 0.303 | 0.29 |
| 2.984999999999874 | 0.318 | 0.303 | 0.29 |
| 2.989999999999874 | 0.317 | 0.302 | 0.289 |
| 2.994999999999874 | 0.317 | 0.302 | 0.289 |
| 2.999999999999874 | 0.316 | 0.302 | 0.289 |
| 3.004999999999874 | 0.316 | 0.301 | 0.288 |
| 3.009999999999874 | 0.315 | 0.301 | 0.288 |
| 3.014999999999874 | 0.315 | 0.3 | 0.288 |
| 3.019999999999873 | 0.314 | 0.3 | 0.287 |
| 3.024999999999873 | 0.314 | 0.299 | 0.287 |
| 3.029999999999873 | 0.313 | 0.299 | 0.287 |
| 3.034999999999873 | 0.313 | 0.299 | 0.286 |
| 3.039999999999873 | 0.312 | 0.298 | 0.286 |
| 3.044999999999873 | 0.312 | 0.298 | 0.285 |
| 3.049999999999873 | 0.312 | 0.297 | 0.285 |
| 3.054999999999873 | 0.311 | 0.297 | 0.285 |
| 3.059999999999873 | 0.311 | 0.297 | 0.284 |
| 3.064999999999872 | 0.31 | 0.296 | 0.284 |
| 3.069999999999872 | 0.31 | 0.296 | 0.284 |
| 3.074999999999872 | 0.309 | 0.295 | 0.283 |
| 3.079999999999872 | 0.309 | 0.295 | 0.283 |
| 3.084999999999872 | 0.308 | 0.295 | 0.283 |
| 3.089999999999872 | 0.308 | 0.294 | 0.282 |
| 3.094999999999872 | 0.307 | 0.294 | 0.282 |
| 3.099999999999872 | 0.307 | 0.293 | 0.282 |
| 3.104999999999872 | 0.307 | 0.293 | 0.281 |
| 3.109999999999872 | 0.306 | 0.293 | 0.281 |
| 3.114999999999871 | 0.306 | 0.292 | 0.281 |
| 3.119999999999871 | 0.305 | 0.292 | 0.28 |
| 3.124999999999871 | 0.305 | 0.292 | 0.28 |
| 3.129999999999871 | 0.304 | 0.291 | 0.28 |
| 3.134999999999871 | 0.304 | 0.291 | 0.279 |
| 3.139999999999871 | 0.303 | 0.29 | 0.279 |
| 3.144999999999871 | 0.303 | 0.29 | 0.279 |
| 3.149999999999871 | 0.303 | 0.29 | 0.278 |
| 3.154999999999871 | 0.302 | 0.289 | 0.278 |
| 3.15999999999987 | 0.302 | 0.289 | 0.278 |
| 3.16499999999987 | 0.301 | 0.288 | 0.277 |
| 3.16999999999987 | 0.301 | 0.288 | 0.277 |
| 3.17499999999987 | 0.3 | 0.288 | 0.276 |
| 3.17999999999987 | 0.3 | 0.287 | 0.276 |
| 3.18499999999987 | 0.3 | 0.287 | 0.276 |
| 3.18999999999987 | 0.299 | 0.287 | 0.275 |
| 3.19499999999987 | 0.299 | 0.286 | 0.275 |
| 3.19999999999987 | 0.298 | 0.286 | 0.275 |
| 3.204999999999869 | 0.298 | 0.285 | 0.274 |
| 3.209999999999869 | 0.297 | 0.285 | 0.274 |
| 3.214999999999869 | 0.297 | 0.285 | 0.274 |
| 3.219999999999869 | 0.297 | 0.284 | 0.274 |
| 3.224999999999869 | 0.296 | 0.284 | 0.273 |
| 3.229999999999869 | 0.296 | 0.284 | 0.273 |
| 3.234999999999869 | 0.295 | 0.283 | 0.273 |
| 3.239999999999869 | 0.295 | 0.283 | 0.272 |
| 3.244999999999869 | 0.294 | 0.283 | 0.272 |
| 3.249999999999869 | 0.294 | 0.282 | 0.272 |
| 3.254999999999868 | 0.294 | 0.282 | 0.271 |
| 3.259999999999868 | 0.293 | 0.281 | 0.271 |
| 3.264999999999868 | 0.293 | 0.281 | 0.271 |
| 3.269999999999868 | 0.292 | 0.281 | 0.27 |
| 3.274999999999868 | 0.292 | 0.28 | 0.27 |
| 3.279999999999868 | 0.292 | 0.28 | 0.27 |
| 3.284999999999868 | 0.291 | 0.28 | 0.269 |
| 3.289999999999868 | 0.291 | 0.279 | 0.269 |
| 3.294999999999868 | 0.29 | 0.279 | 0.269 |
| 3.299999999999867 | 0.29 | 0.279 | 0.268 |
| 3.304999999999867 | 0.29 | 0.278 | 0.268 |
| 3.309999999999867 | 0.289 | 0.278 | 0.268 |
| 3.314999999999867 | 0.289 | 0.277 | 0.267 |
| 3.319999999999867 | 0.288 | 0.277 | 0.267 |
| 3.324999999999867 | 0.288 | 0.277 | 0.267 |
| 3.329999999999867 | 0.288 | 0.276 | 0.266 |
| 3.334999999999867 | 0.287 | 0.276 | 0.266 |
| 3.339999999999867 | 0.287 | 0.276 | 0.266 |
| 3.344999999999866 | 0.286 | 0.275 | 0.265 |
| 3.349999999999866 | 0.286 | 0.275 | 0.265 |
| 3.354999999999866 | 0.286 | 0.275 | 0.265 |
| 3.359999999999866 | 0.285 | 0.274 | 0.265 |
| 3.364999999999866 | 0.285 | 0.274 | 0.264 |
| 3.369999999999866 | 0.284 | 0.274 | 0.264 |
| 3.374999999999866 | 0.284 | 0.273 | 0.264 |
| 3.379999999999866 | 0.284 | 0.273 | 0.263 |
| 3.384999999999866 | 0.283 | 0.273 | 0.263 |
| 3.389999999999866 | 0.283 | 0.272 | 0.263 |
| 3.394999999999865 | 0.283 | 0.272 | 0.262 |
| 3.399999999999865 | 0.282 | 0.272 | 0.262 |
| 3.404999999999865 | 0.282 | 0.271 | 0.262 |
| 3.409999999999865 | 0.281 | 0.271 | 0.261 |
| 3.414999999999865 | 0.281 | 0.271 | 0.261 |
| 3.419999999999865 | 0.281 | 0.27 | 0.261 |
| 3.424999999999865 | 0.28 | 0.27 | 0.261 |
| 3.429999999999865 | 0.28 | 0.27 | 0.26 |
| 3.434999999999865 | 0.28 | 0.269 | 0.26 |
| 3.439999999999864 | 0.279 | 0.269 | 0.26 |
| 3.444999999999864 | 0.279 | 0.269 | 0.259 |
| 3.449999999999864 | 0.278 | 0.268 | 0.259 |
| 3.454999999999864 | 0.278 | 0.268 | 0.259 |
| 3.459999999999864 | 0.278 | 0.268 | 0.258 |
| 3.464999999999864 | 0.277 | 0.267 | 0.258 |
| 3.469999999999864 | 0.277 | 0.267 | 0.258 |
| 3.474999999999864 | 0.277 | 0.267 | 0.258 |
| 3.479999999999864 | 0.276 | 0.266 | 0.257 |
| 3.484999999999864 | 0.276 | 0.266 | 0.257 |
| 3.489999999999863 | 0.275 | 0.266 | 0.257 |
| 3.494999999999863 | 0.275 | 0.265 | 0.256 |
| 3.499999999999863 | 0.275 | 0.265 | 0.256 |
| 3.504999999999863 | 0.274 | 0.265 | 0.256 |
| 3.509999999999863 | 0.274 | 0.264 | 0.255 |
| 3.514999999999863 | 0.274 | 0.264 | 0.255 |
| 3.519999999999863 | 0.273 | 0.264 | 0.255 |
| 3.524999999999863 | 0.273 | 0.263 | 0.255 |
| 3.529999999999863 | 0.273 | 0.263 | 0.254 |
| 3.534999999999862 | 0.272 | 0.263 | 0.254 |
| 3.539999999999862 | 0.272 | 0.262 | 0.254 |
| 3.544999999999862 | 0.271 | 0.262 | 0.253 |
| 3.549999999999862 | 0.271 | 0.262 | 0.253 |
| 3.554999999999862 | 0.271 | 0.261 | 0.253 |
| 3.559999999999862 | 0.27 | 0.261 | 0.253 |
| 3.564999999999862 | 0.27 | 0.261 | 0.252 |
| 3.569999999999862 | 0.27 | 0.26 | 0.252 |
| 3.574999999999862 | 0.269 | 0.26 | 0.252 |
| 3.579999999999862 | 0.269 | 0.26 | 0.251 |
| 3.584999999999861 | 0.269 | 0.259 | 0.251 |
| 3.589999999999861 | 0.268 | 0.259 | 0.251 |
| 3.594999999999861 | 0.268 | 0.259 | 0.251 |
| 3.599999999999861 | 0.268 | 0.259 | 0.25 |
| 3.604999999999861 | 0.267 | 0.258 | 0.25 |
| 3.609999999999861 | 0.267 | 0.258 | 0.25 |
| 3.614999999999861 | 0.267 | 0.258 | 0.249 |
| 3.619999999999861 | 0.266 | 0.257 | 0.249 |
| 3.62499999999986 | 0.266 | 0.257 | 0.249 |
| 3.62999999999986 | 0.266 | 0.257 | 0.249 |
| 3.63499999999986 | 0.265 | 0.256 | 0.248 |
| 3.63999999999986 | 0.265 | 0.256 | 0.248 |
| 3.64499999999986 | 0.265 | 0.256 | 0.248 |
| 3.64999999999986 | 0.264 | 0.255 | 0.248 |
| 3.65499999999986 | 0.264 | 0.255 | 0.247 |
| 3.65999999999986 | 0.264 | 0.255 | 0.247 |
| 3.66499999999986 | 0.263 | 0.255 | 0.247 |
| 3.669999999999859 | 0.263 | 0.254 | 0.246 |
| 3.674999999999859 | 0.263 | 0.254 | 0.246 |
| 3.679999999999859 | 0.262 | 0.254 | 0.246 |
| 3.684999999999859 | 0.262 | 0.253 | 0.246 |
| 3.689999999999859 | 0.262 | 0.253 | 0.245 |
| 3.694999999999859 | 0.261 | 0.253 | 0.245 |
| 3.699999999999859 | 0.261 | 0.252 | 0.245 |
| 3.704999999999859 | 0.261 | 0.252 | 0.245 |
| 3.709999999999859 | 0.26 | 0.252 | 0.244 |
| 3.714999999999859 | 0.26 | 0.252 | 0.244 |
| 3.719999999999858 | 0.26 | 0.251 | 0.244 |
| 3.724999999999858 | 0.259 | 0.251 | 0.243 |
| 3.729999999999858 | 0.259 | 0.251 | 0.243 |
| 3.734999999999858 | 0.259 | 0.25 | 0.243 |
| 3.739999999999858 | 0.258 | 0.25 | 0.243 |
| 3.744999999999858 | 0.258 | 0.25 | 0.242 |
| 3.749999999999858 | 0.258 | 0.25 | 0.242 |
| 3.754999999999858 | 0.257 | 0.249 | 0.242 |
| 3.759999999999858 | 0.257 | 0.249 | 0.242 |
| 3.764999999999857 | 0.257 | 0.249 | 0.241 |
| 3.769999999999857 | 0.256 | 0.248 | 0.241 |
| 3.774999999999857 | 0.256 | 0.248 | 0.241 |
| 3.779999999999857 | 0.256 | 0.248 | 0.241 |
| 3.784999999999857 | 0.255 | 0.247 | 0.24 |
| 3.789999999999857 | 0.255 | 0.247 | 0.24 |
| 3.794999999999857 | 0.255 | 0.247 | 0.24 |
| 3.799999999999857 | 0.254 | 0.247 | 0.239 |
| 3.804999999999857 | 0.254 | 0.246 | 0.239 |
| 3.809999999999857 | 0.254 | 0.246 | 0.239 |
| 3.814999999999856 | 0.254 | 0.246 | 0.239 |
| 3.819999999999856 | 0.253 | 0.245 | 0.238 |
| 3.824999999999856 | 0.253 | 0.245 | 0.238 |
| 3.829999999999856 | 0.253 | 0.245 | 0.238 |
| 3.834999999999856 | 0.252 | 0.245 | 0.238 |
| 3.839999999999856 | 0.252 | 0.244 | 0.237 |
| 3.844999999999856 | 0.252 | 0.244 | 0.237 |
| 3.849999999999856 | 0.251 | 0.244 | 0.237 |
| 3.854999999999856 | 0.251 | 0.244 | 0.237 |
| 3.859999999999855 | 0.251 | 0.243 | 0.236 |
| 3.864999999999855 | 0.25 | 0.243 | 0.236 |
| 3.869999999999855 | 0.25 | 0.243 | 0.236 |
| 3.874999999999855 | 0.25 | 0.242 | 0.236 |
| 3.879999999999855 | 0.25 | 0.242 | 0.235 |
| 3.884999999999855 | 0.249 | 0.242 | 0.235 |
| 3.889999999999855 | 0.249 | 0.242 | 0.235 |
| 3.894999999999855 | 0.249 | 0.241 | 0.235 |
| 3.899999999999855 | 0.248 | 0.241 | 0.234 |
| 3.904999999999855 | 0.248 | 0.241 | 0.234 |
| 3.909999999999854 | 0.248 | 0.241 | 0.234 |
| 3.914999999999854 | 0.247 | 0.24 | 0.234 |
| 3.919999999999854 | 0.247 | 0.24 | 0.233 |
| 3.924999999999854 | 0.247 | 0.24 | 0.233 |
| 3.929999999999854 | 0.247 | 0.239 | 0.233 |
| 3.934999999999854 | 0.246 | 0.239 | 0.233 |
| 3.939999999999854 | 0.246 | 0.239 | 0.232 |
| 3.944999999999854 | 0.246 | 0.239 | 0.232 |
| 3.949999999999854 | 0.245 | 0.238 | 0.232 |
| 3.954999999999853 | 0.245 | 0.238 | 0.232 |
| 3.959999999999853 | 0.245 | 0.238 | 0.231 |
| 3.964999999999853 | 0.245 | 0.238 | 0.231 |
| 3.969999999999853 | 0.244 | 0.237 | 0.231 |
| 3.974999999999853 | 0.244 | 0.237 | 0.231 |
| 3.979999999999853 | 0.244 | 0.237 | 0.23 |
| 3.984999999999853 | 0.243 | 0.236 | 0.23 |
| 3.989999999999853 | 0.243 | 0.236 | 0.23 |
| 3.994999999999853 | 0.243 | 0.236 | 0.23 |
| 3.999999999999853 | 0.243 | 0.236 | 0.229 |
| 4.004999999999852 | 0.242 | 0.235 | 0.229 |
| 4.009999999999852 | 0.242 | 0.235 | 0.229 |
| 4.014999999999852 | 0.242 | 0.235 | 0.229 |
| 4.019999999999852 | 0.241 | 0.235 | 0.228 |
| 4.024999999999852 | 0.241 | 0.234 | 0.228 |
| 4.029999999999852 | 0.241 | 0.234 | 0.228 |
| 4.034999999999852 | 0.241 | 0.234 | 0.228 |
| 4.039999999999851 | 0.24 | 0.234 | 0.227 |
| 4.044999999999852 | 0.24 | 0.233 | 0.227 |
| 4.049999999999851 | 0.24 | 0.233 | 0.227 |
| 4.054999999999851 | 0.239 | 0.233 | 0.227 |
| 4.059999999999851 | 0.239 | 0.233 | 0.227 |
| 4.064999999999851 | 0.239 | 0.232 | 0.226 |
| 4.069999999999851 | 0.239 | 0.232 | 0.226 |
| 4.074999999999851 | 0.238 | 0.232 | 0.226 |
| 4.07999999999985 | 0.238 | 0.232 | 0.226 |
| 4.084999999999851 | 0.238 | 0.231 | 0.225 |
| 4.08999999999985 | 0.238 | 0.231 | 0.225 |
| 4.094999999999851 | 0.237 | 0.231 | 0.225 |
| 4.09999999999985 | 0.237 | 0.231 | 0.225 |
| 4.10499999999985 | 0.237 | 0.23 | 0.224 |
| 4.10999999999985 | 0.236 | 0.23 | 0.224 |
| 4.11499999999985 | 0.236 | 0.23 | 0.224 |
| 4.11999999999985 | 0.236 | 0.23 | 0.224 |
| 4.12499999999985 | 0.236 | 0.229 | 0.224 |
| 4.12999999999985 | 0.235 | 0.229 | 0.223 |
| 4.13499999999985 | 0.235 | 0.229 | 0.223 |
| 4.13999999999985 | 0.235 | 0.229 | 0.223 |
| 4.144999999999849 | 0.235 | 0.228 | 0.223 |
| 4.14999999999985 | 0.234 | 0.228 | 0.222 |
| 4.154999999999849 | 0.234 | 0.228 | 0.222 |
| 4.15999999999985 | 0.234 | 0.228 | 0.222 |
| 4.164999999999849 | 0.233 | 0.227 | 0.222 |
| 4.169999999999849 | 0.233 | 0.227 | 0.221 |
| 4.174999999999849 | 0.233 | 0.227 | 0.221 |
| 4.179999999999848 | 0.233 | 0.227 | 0.221 |
| 4.184999999999849 | 0.232 | 0.226 | 0.221 |
| 4.189999999999848 | 0.232 | 0.226 | 0.221 |
| 4.194999999999848 | 0.232 | 0.226 | 0.22 |
| 4.199999999999848 | 0.232 | 0.226 | 0.22 |
| 4.204999999999848 | 0.231 | 0.225 | 0.22 |
| 4.209999999999848 | 0.231 | 0.225 | 0.22 |
| 4.214999999999848 | 0.231 | 0.225 | 0.219 |
| 4.219999999999847 | 0.231 | 0.225 | 0.219 |
| 4.224999999999848 | 0.23 | 0.224 | 0.219 |
| 4.229999999999847 | 0.23 | 0.224 | 0.219 |
| 4.234999999999847 | 0.23 | 0.224 | 0.219 |
| 4.239999999999847 | 0.23 | 0.224 | 0.218 |
| 4.244999999999847 | 0.229 | 0.223 | 0.218 |
| 4.249999999999847 | 0.229 | 0.223 | 0.218 |
| 4.254999999999847 | 0.229 | 0.223 | 0.218 |
| 4.259999999999846 | 0.229 | 0.223 | 0.217 |
| 4.264999999999847 | 0.228 | 0.223 | 0.217 |
| 4.269999999999846 | 0.228 | 0.222 | 0.217 |
| 4.274999999999846 | 0.228 | 0.222 | 0.217 |
| 4.279999999999846 | 0.228 | 0.222 | 0.217 |
| 4.284999999999846 | 0.227 | 0.222 | 0.216 |
| 4.289999999999846 | 0.227 | 0.221 | 0.216 |
| 4.294999999999846 | 0.227 | 0.221 | 0.216 |
| 4.299999999999846 | 0.227 | 0.221 | 0.216 |
| 4.304999999999846 | 0.226 | 0.221 | 0.216 |
| 4.309999999999845 | 0.226 | 0.22 | 0.215 |
| 4.314999999999846 | 0.226 | 0.22 | 0.215 |
| 4.319999999999845 | 0.226 | 0.22 | 0.215 |
| 4.324999999999846 | 0.225 | 0.22 | 0.215 |
| 4.329999999999845 | 0.225 | 0.22 | 0.214 |
| 4.334999999999845 | 0.225 | 0.219 | 0.214 |
| 4.339999999999845 | 0.225 | 0.219 | 0.214 |
| 4.344999999999845 | 0.224 | 0.219 | 0.214 |
| 4.349999999999845 | 0.224 | 0.219 | 0.214 |
| 4.354999999999845 | 0.224 | 0.218 | 0.213 |
| 4.359999999999844 | 0.224 | 0.218 | 0.213 |
| 4.364999999999845 | 0.223 | 0.218 | 0.213 |
| 4.369999999999844 | 0.223 | 0.218 | 0.213 |
| 4.374999999999844 | 0.223 | 0.217 | 0.213 |
| 4.379999999999844 | 0.223 | 0.217 | 0.212 |
| 4.384999999999844 | 0.222 | 0.217 | 0.212 |
| 4.389999999999844 | 0.222 | 0.217 | 0.212 |
| 4.394999999999844 | 0.222 | 0.217 | 0.212 |
| 4.399999999999844 | 0.222 | 0.216 | 0.211 |
| 4.404999999999844 | 0.221 | 0.216 | 0.211 |
| 4.409999999999843 | 0.221 | 0.216 | 0.211 |
| 4.414999999999844 | 0.221 | 0.216 | 0.211 |
| 4.419999999999843 | 0.221 | 0.215 | 0.211 |
| 4.424999999999843 | 0.22 | 0.215 | 0.21 |
| 4.429999999999843 | 0.22 | 0.215 | 0.21 |
| 4.434999999999843 | 0.22 | 0.215 | 0.21 |
| 4.439999999999843 | 0.22 | 0.215 | 0.21 |
| 4.444999999999843 | 0.219 | 0.214 | 0.21 |
| 4.449999999999842 | 0.219 | 0.214 | 0.209 |
| 4.454999999999843 | 0.219 | 0.214 | 0.209 |
| 4.459999999999842 | 0.219 | 0.214 | 0.209 |
| 4.464999999999843 | 0.219 | 0.214 | 0.209 |
| 4.469999999999842 | 0.218 | 0.213 | 0.209 |
| 4.474999999999842 | 0.218 | 0.213 | 0.208 |
| 4.479999999999842 | 0.218 | 0.213 | 0.208 |
| 4.484999999999842 | 0.218 | 0.213 | 0.208 |
| 4.489999999999842 | 0.217 | 0.212 | 0.208 |
| 4.494999999999842 | 0.217 | 0.212 | 0.208 |
| 4.499999999999841 | 0.217 | 0.212 | 0.207 |
| 4.504999999999842 | 0.217 | 0.212 | 0.207 |
| 4.509999999999841 | 0.216 | 0.212 | 0.207 |
| 4.514999999999842 | 0.216 | 0.211 | 0.207 |
| 4.519999999999841 | 0.216 | 0.211 | 0.207 |
| 4.524999999999841 | 0.216 | 0.211 | 0.206 |
| 4.529999999999841 | 0.216 | 0.211 | 0.206 |
| 4.534999999999841 | 0.215 | 0.211 | 0.206 |
| 4.53999999999984 | 0.215 | 0.21 | 0.206 |
| 4.544999999999841 | 0.215 | 0.21 | 0.206 |
| 4.54999999999984 | 0.215 | 0.21 | 0.205 |
| 4.554999999999841 | 0.214 | 0.21 | 0.205 |
| 4.55999999999984 | 0.214 | 0.209 | 0.205 |
| 4.564999999999841 | 0.214 | 0.209 | 0.205 |
| 4.56999999999984 | 0.214 | 0.209 | 0.205 |
| 4.57499999999984 | 0.214 | 0.209 | 0.204 |
| 4.57999999999984 | 0.213 | 0.209 | 0.204 |
| 4.58499999999984 | 0.213 | 0.208 | 0.204 |
| 4.58999999999984 | 0.213 | 0.208 | 0.204 |
| 4.59499999999984 | 0.213 | 0.208 | 0.204 |
| 4.59999999999984 | 0.212 | 0.208 | 0.203 |
| 4.60499999999984 | 0.212 | 0.208 | 0.203 |
| 4.60999999999984 | 0.212 | 0.207 | 0.203 |
| 4.614999999999839 | 0.212 | 0.207 | 0.203 |
| 4.61999999999984 | 0.212 | 0.207 | 0.203 |
| 4.624999999999839 | 0.211 | 0.207 | 0.202 |
| 4.62999999999984 | 0.211 | 0.207 | 0.202 |
| 4.634999999999839 | 0.211 | 0.206 | 0.202 |
| 4.639999999999838 | 0.211 | 0.206 | 0.202 |
| 4.644999999999839 | 0.21 | 0.206 | 0.202 |
| 4.649999999999838 | 0.21 | 0.206 | 0.202 |
| 4.654999999999839 | 0.21 | 0.206 | 0.201 |
| 4.659999999999838 | 0.21 | 0.205 | 0.201 |
| 4.664999999999838 | 0.21 | 0.205 | 0.201 |
| 4.669999999999838 | 0.209 | 0.205 | 0.201 |
| 4.674999999999838 | 0.209 | 0.205 | 0.201 |
| 4.679999999999837 | 0.209 | 0.205 | 0.2 |
| 4.684999999999838 | 0.209 | 0.204 | 0.2 |
| 4.689999999999837 | 0.209 | 0.204 | 0.2 |
| 4.694999999999838 | 0.208 | 0.204 | 0.2 |
| 4.699999999999837 | 0.208 | 0.204 | 0.2 |
| 4.704999999999837 | 0.208 | 0.204 | 0.199 |
| 4.709999999999837 | 0.208 | 0.203 | 0.199 |
| 4.714999999999837 | 0.207 | 0.203 | 0.199 |
| 4.719999999999837 | 0.207 | 0.203 | 0.199 |
| 4.724999999999837 | 0.207 | 0.203 | 0.199 |
| 4.729999999999836 | 0.207 | 0.203 | 0.199 |
| 4.734999999999836 | 0.207 | 0.202 | 0.198 |
| 4.739999999999836 | 0.206 | 0.202 | 0.198 |
| 4.744999999999836 | 0.206 | 0.202 | 0.198 |
| 4.749999999999836 | 0.206 | 0.202 | 0.198 |
| 4.754999999999836 | 0.206 | 0.202 | 0.198 |
| 4.759999999999836 | 0.206 | 0.201 | 0.197 |
| 4.764999999999836 | 0.205 | 0.201 | 0.197 |
| 4.769999999999836 | 0.205 | 0.201 | 0.197 |
| 4.774999999999835 | 0.205 | 0.201 | 0.197 |
| 4.779999999999835 | 0.205 | 0.201 | 0.197 |
| 4.784999999999835 | 0.205 | 0.2 | 0.197 |
| 4.789999999999835 | 0.204 | 0.2 | 0.196 |
| 4.794999999999835 | 0.204 | 0.2 | 0.196 |
| 4.799999999999835 | 0.204 | 0.2 | 0.196 |
| 4.804999999999835 | 0.204 | 0.2 | 0.196 |
| 4.809999999999835 | 0.204 | 0.199 | 0.196 |
| 4.814999999999835 | 0.203 | 0.199 | 0.195 |
| 4.819999999999835 | 0.203 | 0.199 | 0.195 |
| 4.824999999999835 | 0.203 | 0.199 | 0.195 |
| 4.829999999999834 | 0.203 | 0.199 | 0.195 |
| 4.834999999999834 | 0.203 | 0.199 | 0.195 |
| 4.839999999999834 | 0.202 | 0.198 | 0.195 |
| 4.844999999999834 | 0.202 | 0.198 | 0.194 |
| 4.849999999999834 | 0.202 | 0.198 | 0.194 |
| 4.854999999999834 | 0.202 | 0.198 | 0.194 |
| 4.859999999999834 | 0.202 | 0.198 | 0.194 |
| 4.864999999999834 | 0.201 | 0.197 | 0.194 |
| 4.869999999999834 | 0.201 | 0.197 | 0.193 |
| 4.874999999999834 | 0.201 | 0.197 | 0.193 |
| 4.879999999999833 | 0.201 | 0.197 | 0.193 |
| 4.884999999999834 | 0.201 | 0.197 | 0.193 |
| 4.889999999999833 | 0.2 | 0.196 | 0.193 |
| 4.894999999999833 | 0.2 | 0.196 | 0.193 |
| 4.899999999999833 | 0.2 | 0.196 | 0.192 |
| 4.904999999999833 | 0.2 | 0.196 | 0.192 |
| 4.909999999999833 | 0.2 | 0.196 | 0.192 |
| 4.914999999999833 | 0.199 | 0.196 | 0.192 |
| 4.919999999999832 | 0.199 | 0.195 | 0.192 |
| 4.924999999999833 | 0.199 | 0.195 | 0.192 |
| 4.929999999999832 | 0.199 | 0.195 | 0.191 |
| 4.934999999999832 | 0.199 | 0.195 | 0.191 |
| 4.939999999999832 | 0.198 | 0.195 | 0.191 |
| 4.944999999999832 | 0.198 | 0.194 | 0.191 |
| 4.949999999999832 | 0.198 | 0.194 | 0.191 |
| 4.954999999999832 | 0.198 | 0.194 | 0.191 |
| 4.959999999999832 | 0.198 | 0.194 | 0.19 |
| 4.964999999999832 | 0.197 | 0.194 | 0.19 |
| 4.969999999999831 | 0.197 | 0.194 | 0.19 |
| 4.974999999999831 | 0.197 | 0.193 | 0.19 |
| 4.97999999999983 | 0.197 | 0.193 | 0.19 |
| 4.984999999999831 | 0.197 | 0.193 | 0.189 |
| 4.98999999999983 | 0.196 | 0.193 | 0.189 |
| 4.994999999999831 | 0.196 | 0.193 | 0.189 |
| 4.99999999999983 | 0.196 | 0.192 | 0.189 |